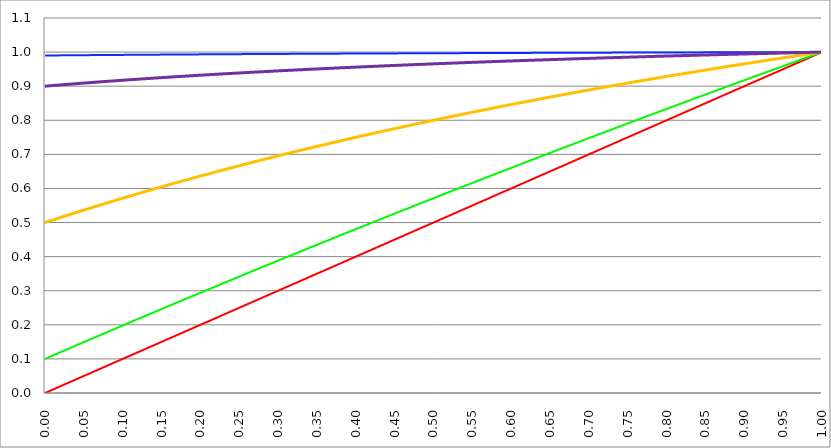
| Category | Series 1 | Series 0 | Series 2 | Series 3 | Series 4 |
|---|---|---|---|---|---|
| 0.0 | 0 | 0.1 | 0.99 | 0.5 | 0.9 |
| 0.0005 | 0.001 | 0.1 | 0.99 | 0.5 | 0.9 |
| 0.001 | 0.001 | 0.101 | 0.99 | 0.501 | 0.9 |
| 0.0015 | 0.002 | 0.101 | 0.99 | 0.501 | 0.9 |
| 0.002 | 0.002 | 0.102 | 0.99 | 0.501 | 0.9 |
| 0.0025 | 0.003 | 0.102 | 0.99 | 0.502 | 0.9 |
| 0.003 | 0.003 | 0.103 | 0.99 | 0.502 | 0.901 |
| 0.0035 | 0.004 | 0.103 | 0.99 | 0.503 | 0.901 |
| 0.004 | 0.004 | 0.104 | 0.99 | 0.503 | 0.901 |
| 0.0045 | 0.005 | 0.104 | 0.99 | 0.503 | 0.901 |
| 0.005 | 0.005 | 0.105 | 0.99 | 0.504 | 0.901 |
| 0.0055 | 0.006 | 0.105 | 0.99 | 0.504 | 0.901 |
| 0.006 | 0.006 | 0.106 | 0.99 | 0.504 | 0.901 |
| 0.0065 | 0.007 | 0.106 | 0.99 | 0.505 | 0.901 |
| 0.007 | 0.007 | 0.107 | 0.99 | 0.505 | 0.901 |
| 0.0075 | 0.008 | 0.107 | 0.99 | 0.506 | 0.901 |
| 0.008 | 0.008 | 0.108 | 0.99 | 0.506 | 0.902 |
| 0.0085 | 0.009 | 0.108 | 0.99 | 0.506 | 0.902 |
| 0.009 | 0.009 | 0.109 | 0.99 | 0.507 | 0.902 |
| 0.0095 | 0.01 | 0.109 | 0.99 | 0.507 | 0.902 |
| 0.01 | 0.01 | 0.11 | 0.99 | 0.507 | 0.902 |
| 0.0105 | 0.011 | 0.11 | 0.99 | 0.508 | 0.902 |
| 0.011 | 0.011 | 0.111 | 0.99 | 0.508 | 0.902 |
| 0.0115 | 0.012 | 0.111 | 0.99 | 0.509 | 0.902 |
| 0.012 | 0.012 | 0.112 | 0.99 | 0.509 | 0.902 |
| 0.0125 | 0.013 | 0.112 | 0.99 | 0.509 | 0.902 |
| 0.013 | 0.013 | 0.113 | 0.99 | 0.51 | 0.902 |
| 0.0135 | 0.014 | 0.113 | 0.99 | 0.51 | 0.903 |
| 0.014 | 0.014 | 0.114 | 0.99 | 0.51 | 0.903 |
| 0.0145 | 0.015 | 0.114 | 0.99 | 0.511 | 0.903 |
| 0.015 | 0.015 | 0.115 | 0.99 | 0.511 | 0.903 |
| 0.0155 | 0.016 | 0.115 | 0.99 | 0.512 | 0.903 |
| 0.016 | 0.016 | 0.116 | 0.99 | 0.512 | 0.903 |
| 0.0165 | 0.017 | 0.116 | 0.99 | 0.512 | 0.903 |
| 0.017 | 0.017 | 0.117 | 0.99 | 0.513 | 0.903 |
| 0.0175 | 0.018 | 0.117 | 0.99 | 0.513 | 0.903 |
| 0.018 | 0.018 | 0.118 | 0.99 | 0.513 | 0.903 |
| 0.0185 | 0.019 | 0.118 | 0.99 | 0.514 | 0.903 |
| 0.019 | 0.019 | 0.119 | 0.99 | 0.514 | 0.904 |
| 0.0195 | 0.02 | 0.119 | 0.99 | 0.514 | 0.904 |
| 0.02 | 0.02 | 0.12 | 0.99 | 0.515 | 0.904 |
| 0.0205 | 0.021 | 0.12 | 0.99 | 0.515 | 0.904 |
| 0.021 | 0.021 | 0.121 | 0.99 | 0.516 | 0.904 |
| 0.0215 | 0.022 | 0.121 | 0.99 | 0.516 | 0.904 |
| 0.022 | 0.022 | 0.122 | 0.99 | 0.516 | 0.904 |
| 0.0225 | 0.023 | 0.122 | 0.99 | 0.517 | 0.904 |
| 0.023 | 0.023 | 0.123 | 0.99 | 0.517 | 0.904 |
| 0.0235 | 0.024 | 0.123 | 0.99 | 0.517 | 0.904 |
| 0.024 | 0.024 | 0.124 | 0.99 | 0.518 | 0.904 |
| 0.0245 | 0.025 | 0.124 | 0.99 | 0.518 | 0.905 |
| 0.025 | 0.025 | 0.125 | 0.99 | 0.519 | 0.905 |
| 0.0255 | 0.026 | 0.125 | 0.99 | 0.519 | 0.905 |
| 0.026 | 0.026 | 0.126 | 0.991 | 0.519 | 0.905 |
| 0.0265 | 0.027 | 0.126 | 0.991 | 0.52 | 0.905 |
| 0.027 | 0.027 | 0.127 | 0.991 | 0.52 | 0.905 |
| 0.0275 | 0.028 | 0.127 | 0.991 | 0.52 | 0.905 |
| 0.028 | 0.028 | 0.128 | 0.991 | 0.521 | 0.905 |
| 0.0285 | 0.029 | 0.128 | 0.991 | 0.521 | 0.905 |
| 0.029 | 0.029 | 0.129 | 0.991 | 0.521 | 0.905 |
| 0.0295 | 0.03 | 0.129 | 0.991 | 0.522 | 0.905 |
| 0.03 | 0.03 | 0.13 | 0.991 | 0.522 | 0.906 |
| 0.0305 | 0.031 | 0.13 | 0.991 | 0.523 | 0.906 |
| 0.031 | 0.031 | 0.131 | 0.991 | 0.523 | 0.906 |
| 0.0315 | 0.032 | 0.131 | 0.991 | 0.523 | 0.906 |
| 0.032 | 0.032 | 0.132 | 0.991 | 0.524 | 0.906 |
| 0.0325 | 0.033 | 0.132 | 0.991 | 0.524 | 0.906 |
| 0.033 | 0.033 | 0.133 | 0.991 | 0.524 | 0.906 |
| 0.0335 | 0.034 | 0.133 | 0.991 | 0.525 | 0.906 |
| 0.034 | 0.034 | 0.134 | 0.991 | 0.525 | 0.906 |
| 0.0345 | 0.035 | 0.134 | 0.991 | 0.525 | 0.906 |
| 0.035 | 0.035 | 0.135 | 0.991 | 0.526 | 0.906 |
| 0.0355 | 0.036 | 0.135 | 0.991 | 0.526 | 0.907 |
| 0.036 | 0.036 | 0.136 | 0.991 | 0.527 | 0.907 |
| 0.0365 | 0.037 | 0.136 | 0.991 | 0.527 | 0.907 |
| 0.037 | 0.037 | 0.136 | 0.991 | 0.527 | 0.907 |
| 0.0375 | 0.038 | 0.137 | 0.991 | 0.528 | 0.907 |
| 0.038 | 0.038 | 0.137 | 0.991 | 0.528 | 0.907 |
| 0.0385 | 0.039 | 0.138 | 0.991 | 0.528 | 0.907 |
| 0.039 | 0.039 | 0.138 | 0.991 | 0.529 | 0.907 |
| 0.0395 | 0.04 | 0.139 | 0.991 | 0.529 | 0.907 |
| 0.04 | 0.04 | 0.139 | 0.991 | 0.529 | 0.907 |
| 0.0405 | 0.041 | 0.14 | 0.991 | 0.53 | 0.907 |
| 0.041 | 0.041 | 0.14 | 0.991 | 0.53 | 0.908 |
| 0.0415 | 0.042 | 0.141 | 0.991 | 0.53 | 0.908 |
| 0.042 | 0.042 | 0.141 | 0.991 | 0.531 | 0.908 |
| 0.0425 | 0.043 | 0.142 | 0.991 | 0.531 | 0.908 |
| 0.043 | 0.043 | 0.142 | 0.991 | 0.532 | 0.908 |
| 0.0435 | 0.044 | 0.143 | 0.991 | 0.532 | 0.908 |
| 0.044 | 0.044 | 0.143 | 0.991 | 0.532 | 0.908 |
| 0.0445 | 0.045 | 0.144 | 0.991 | 0.533 | 0.908 |
| 0.045 | 0.045 | 0.144 | 0.991 | 0.533 | 0.908 |
| 0.0455 | 0.046 | 0.145 | 0.991 | 0.533 | 0.908 |
| 0.046 | 0.046 | 0.145 | 0.991 | 0.534 | 0.908 |
| 0.0465 | 0.047 | 0.146 | 0.991 | 0.534 | 0.908 |
| 0.047 | 0.047 | 0.146 | 0.991 | 0.534 | 0.909 |
| 0.0475 | 0.048 | 0.147 | 0.991 | 0.535 | 0.909 |
| 0.048 | 0.048 | 0.147 | 0.991 | 0.535 | 0.909 |
| 0.0485 | 0.049 | 0.148 | 0.991 | 0.536 | 0.909 |
| 0.049 | 0.049 | 0.148 | 0.991 | 0.536 | 0.909 |
| 0.0495 | 0.05 | 0.149 | 0.991 | 0.536 | 0.909 |
| 0.05 | 0.05 | 0.149 | 0.991 | 0.537 | 0.909 |
| 0.0505 | 0.051 | 0.15 | 0.991 | 0.537 | 0.909 |
| 0.051 | 0.051 | 0.15 | 0.991 | 0.537 | 0.909 |
| 0.0515 | 0.052 | 0.151 | 0.991 | 0.538 | 0.909 |
| 0.052 | 0.052 | 0.151 | 0.991 | 0.538 | 0.909 |
| 0.0525 | 0.053 | 0.152 | 0.991 | 0.538 | 0.91 |
| 0.053 | 0.053 | 0.152 | 0.991 | 0.539 | 0.91 |
| 0.0535 | 0.054 | 0.153 | 0.991 | 0.539 | 0.91 |
| 0.054 | 0.054 | 0.153 | 0.991 | 0.539 | 0.91 |
| 0.0545 | 0.055 | 0.154 | 0.991 | 0.54 | 0.91 |
| 0.055 | 0.055 | 0.154 | 0.991 | 0.54 | 0.91 |
| 0.0555 | 0.056 | 0.155 | 0.991 | 0.541 | 0.91 |
| 0.056 | 0.056 | 0.155 | 0.991 | 0.541 | 0.91 |
| 0.0565 | 0.057 | 0.156 | 0.991 | 0.541 | 0.91 |
| 0.057 | 0.057 | 0.156 | 0.991 | 0.542 | 0.91 |
| 0.0575 | 0.058 | 0.157 | 0.991 | 0.542 | 0.91 |
| 0.058 | 0.058 | 0.157 | 0.991 | 0.542 | 0.91 |
| 0.0585 | 0.059 | 0.158 | 0.991 | 0.543 | 0.911 |
| 0.059 | 0.059 | 0.158 | 0.991 | 0.543 | 0.911 |
| 0.0595 | 0.06 | 0.159 | 0.991 | 0.543 | 0.911 |
| 0.06 | 0.06 | 0.159 | 0.991 | 0.544 | 0.911 |
| 0.0605 | 0.061 | 0.16 | 0.991 | 0.544 | 0.911 |
| 0.061 | 0.061 | 0.16 | 0.991 | 0.544 | 0.911 |
| 0.0615 | 0.062 | 0.161 | 0.991 | 0.545 | 0.911 |
| 0.062 | 0.062 | 0.161 | 0.991 | 0.545 | 0.911 |
| 0.0625 | 0.063 | 0.161 | 0.991 | 0.545 | 0.911 |
| 0.063 | 0.063 | 0.162 | 0.991 | 0.546 | 0.911 |
| 0.0635 | 0.064 | 0.162 | 0.991 | 0.546 | 0.911 |
| 0.064 | 0.064 | 0.163 | 0.991 | 0.547 | 0.911 |
| 0.0645 | 0.065 | 0.163 | 0.991 | 0.547 | 0.912 |
| 0.065 | 0.065 | 0.164 | 0.991 | 0.547 | 0.912 |
| 0.0655 | 0.066 | 0.164 | 0.991 | 0.548 | 0.912 |
| 0.066 | 0.066 | 0.165 | 0.991 | 0.548 | 0.912 |
| 0.0665 | 0.067 | 0.165 | 0.991 | 0.548 | 0.912 |
| 0.067 | 0.067 | 0.166 | 0.991 | 0.549 | 0.912 |
| 0.0675 | 0.068 | 0.166 | 0.991 | 0.549 | 0.912 |
| 0.068 | 0.068 | 0.167 | 0.991 | 0.549 | 0.912 |
| 0.0685 | 0.069 | 0.167 | 0.991 | 0.55 | 0.912 |
| 0.069 | 0.069 | 0.168 | 0.991 | 0.55 | 0.912 |
| 0.0695 | 0.07 | 0.168 | 0.991 | 0.55 | 0.912 |
| 0.07 | 0.07 | 0.169 | 0.991 | 0.551 | 0.913 |
| 0.0705 | 0.071 | 0.169 | 0.991 | 0.551 | 0.913 |
| 0.071 | 0.071 | 0.17 | 0.991 | 0.551 | 0.913 |
| 0.0715 | 0.072 | 0.17 | 0.991 | 0.552 | 0.913 |
| 0.072 | 0.072 | 0.171 | 0.991 | 0.552 | 0.913 |
| 0.0725 | 0.073 | 0.171 | 0.991 | 0.552 | 0.913 |
| 0.073 | 0.073 | 0.172 | 0.991 | 0.553 | 0.913 |
| 0.0735 | 0.074 | 0.172 | 0.991 | 0.553 | 0.913 |
| 0.074 | 0.074 | 0.173 | 0.991 | 0.554 | 0.913 |
| 0.0745 | 0.075 | 0.173 | 0.991 | 0.554 | 0.913 |
| 0.075 | 0.075 | 0.174 | 0.991 | 0.554 | 0.913 |
| 0.0755 | 0.076 | 0.174 | 0.991 | 0.555 | 0.913 |
| 0.076 | 0.076 | 0.175 | 0.991 | 0.555 | 0.914 |
| 0.0765 | 0.077 | 0.175 | 0.991 | 0.555 | 0.914 |
| 0.077 | 0.077 | 0.176 | 0.991 | 0.556 | 0.914 |
| 0.0775 | 0.078 | 0.176 | 0.991 | 0.556 | 0.914 |
| 0.078 | 0.078 | 0.177 | 0.991 | 0.556 | 0.914 |
| 0.0785 | 0.079 | 0.177 | 0.991 | 0.557 | 0.914 |
| 0.079 | 0.079 | 0.178 | 0.991 | 0.557 | 0.914 |
| 0.0795 | 0.08 | 0.178 | 0.991 | 0.557 | 0.914 |
| 0.08 | 0.08 | 0.179 | 0.991 | 0.558 | 0.914 |
| 0.0805 | 0.081 | 0.179 | 0.991 | 0.558 | 0.914 |
| 0.081 | 0.081 | 0.18 | 0.991 | 0.558 | 0.914 |
| 0.0815 | 0.082 | 0.18 | 0.992 | 0.559 | 0.914 |
| 0.082 | 0.082 | 0.181 | 0.992 | 0.559 | 0.915 |
| 0.0825 | 0.083 | 0.181 | 0.992 | 0.559 | 0.915 |
| 0.083 | 0.083 | 0.181 | 0.992 | 0.56 | 0.915 |
| 0.0835 | 0.084 | 0.182 | 0.992 | 0.56 | 0.915 |
| 0.084 | 0.084 | 0.182 | 0.992 | 0.56 | 0.915 |
| 0.0845 | 0.085 | 0.183 | 0.992 | 0.561 | 0.915 |
| 0.085 | 0.085 | 0.183 | 0.992 | 0.561 | 0.915 |
| 0.0855 | 0.086 | 0.184 | 0.992 | 0.561 | 0.915 |
| 0.086 | 0.086 | 0.184 | 0.992 | 0.562 | 0.915 |
| 0.0865 | 0.087 | 0.185 | 0.992 | 0.562 | 0.915 |
| 0.087 | 0.087 | 0.185 | 0.992 | 0.563 | 0.915 |
| 0.0875 | 0.088 | 0.186 | 0.992 | 0.563 | 0.915 |
| 0.088 | 0.088 | 0.186 | 0.992 | 0.563 | 0.915 |
| 0.0885 | 0.089 | 0.187 | 0.992 | 0.564 | 0.916 |
| 0.089 | 0.089 | 0.187 | 0.992 | 0.564 | 0.916 |
| 0.0895 | 0.09 | 0.188 | 0.992 | 0.564 | 0.916 |
| 0.09 | 0.09 | 0.188 | 0.992 | 0.565 | 0.916 |
| 0.0905 | 0.091 | 0.189 | 0.992 | 0.565 | 0.916 |
| 0.091 | 0.091 | 0.189 | 0.992 | 0.565 | 0.916 |
| 0.0915 | 0.092 | 0.19 | 0.992 | 0.566 | 0.916 |
| 0.092 | 0.092 | 0.19 | 0.992 | 0.566 | 0.916 |
| 0.0925 | 0.093 | 0.191 | 0.992 | 0.566 | 0.916 |
| 0.093 | 0.093 | 0.191 | 0.992 | 0.567 | 0.916 |
| 0.0935 | 0.094 | 0.192 | 0.992 | 0.567 | 0.916 |
| 0.094 | 0.094 | 0.192 | 0.992 | 0.567 | 0.916 |
| 0.0945 | 0.095 | 0.193 | 0.992 | 0.568 | 0.917 |
| 0.095 | 0.095 | 0.193 | 0.992 | 0.568 | 0.917 |
| 0.0955 | 0.096 | 0.194 | 0.992 | 0.568 | 0.917 |
| 0.096 | 0.096 | 0.194 | 0.992 | 0.569 | 0.917 |
| 0.0965 | 0.097 | 0.195 | 0.992 | 0.569 | 0.917 |
| 0.097 | 0.097 | 0.195 | 0.992 | 0.569 | 0.917 |
| 0.0975 | 0.098 | 0.196 | 0.992 | 0.57 | 0.917 |
| 0.098 | 0.098 | 0.196 | 0.992 | 0.57 | 0.917 |
| 0.0985 | 0.099 | 0.197 | 0.992 | 0.57 | 0.917 |
| 0.099 | 0.099 | 0.197 | 0.992 | 0.571 | 0.917 |
| 0.0995 | 0.1 | 0.198 | 0.992 | 0.571 | 0.917 |
| 0.1 | 0.1 | 0.198 | 0.992 | 0.571 | 0.917 |
| 0.1005 | 0.101 | 0.199 | 0.992 | 0.572 | 0.918 |
| 0.101 | 0.101 | 0.199 | 0.992 | 0.572 | 0.918 |
| 0.1015 | 0.102 | 0.199 | 0.992 | 0.572 | 0.918 |
| 0.102 | 0.102 | 0.2 | 0.992 | 0.573 | 0.918 |
| 0.1025 | 0.103 | 0.2 | 0.992 | 0.573 | 0.918 |
| 0.103 | 0.103 | 0.201 | 0.992 | 0.573 | 0.918 |
| 0.1035 | 0.104 | 0.201 | 0.992 | 0.574 | 0.918 |
| 0.104 | 0.104 | 0.202 | 0.992 | 0.574 | 0.918 |
| 0.1045 | 0.105 | 0.202 | 0.992 | 0.574 | 0.918 |
| 0.105 | 0.105 | 0.203 | 0.992 | 0.575 | 0.918 |
| 0.1055 | 0.106 | 0.203 | 0.992 | 0.575 | 0.918 |
| 0.106 | 0.106 | 0.204 | 0.992 | 0.575 | 0.918 |
| 0.1065 | 0.107 | 0.204 | 0.992 | 0.576 | 0.918 |
| 0.107 | 0.107 | 0.205 | 0.992 | 0.576 | 0.919 |
| 0.1075 | 0.108 | 0.205 | 0.992 | 0.577 | 0.919 |
| 0.108 | 0.108 | 0.206 | 0.992 | 0.577 | 0.919 |
| 0.1085 | 0.109 | 0.206 | 0.992 | 0.577 | 0.919 |
| 0.109 | 0.109 | 0.207 | 0.992 | 0.578 | 0.919 |
| 0.1095 | 0.11 | 0.207 | 0.992 | 0.578 | 0.919 |
| 0.11 | 0.11 | 0.208 | 0.992 | 0.578 | 0.919 |
| 0.1105 | 0.111 | 0.208 | 0.992 | 0.579 | 0.919 |
| 0.111 | 0.111 | 0.209 | 0.992 | 0.579 | 0.919 |
| 0.1115 | 0.112 | 0.209 | 0.992 | 0.579 | 0.919 |
| 0.112 | 0.112 | 0.21 | 0.992 | 0.58 | 0.919 |
| 0.1125 | 0.113 | 0.21 | 0.992 | 0.58 | 0.919 |
| 0.113 | 0.113 | 0.211 | 0.992 | 0.58 | 0.919 |
| 0.1135 | 0.114 | 0.211 | 0.992 | 0.581 | 0.92 |
| 0.114 | 0.114 | 0.212 | 0.992 | 0.581 | 0.92 |
| 0.1145 | 0.115 | 0.212 | 0.992 | 0.581 | 0.92 |
| 0.115 | 0.115 | 0.213 | 0.992 | 0.582 | 0.92 |
| 0.1155 | 0.116 | 0.213 | 0.992 | 0.582 | 0.92 |
| 0.116 | 0.116 | 0.214 | 0.992 | 0.582 | 0.92 |
| 0.1165 | 0.117 | 0.214 | 0.992 | 0.583 | 0.92 |
| 0.117 | 0.117 | 0.214 | 0.992 | 0.583 | 0.92 |
| 0.1175 | 0.118 | 0.215 | 0.992 | 0.583 | 0.92 |
| 0.118 | 0.118 | 0.215 | 0.992 | 0.584 | 0.92 |
| 0.1185 | 0.119 | 0.216 | 0.992 | 0.584 | 0.92 |
| 0.119 | 0.119 | 0.216 | 0.992 | 0.584 | 0.92 |
| 0.1195 | 0.12 | 0.217 | 0.992 | 0.585 | 0.921 |
| 0.12 | 0.12 | 0.217 | 0.992 | 0.585 | 0.921 |
| 0.1205 | 0.121 | 0.218 | 0.992 | 0.585 | 0.921 |
| 0.121 | 0.121 | 0.218 | 0.992 | 0.586 | 0.921 |
| 0.1215 | 0.122 | 0.219 | 0.992 | 0.586 | 0.921 |
| 0.122 | 0.122 | 0.219 | 0.992 | 0.586 | 0.921 |
| 0.1225 | 0.123 | 0.22 | 0.992 | 0.587 | 0.921 |
| 0.123 | 0.123 | 0.22 | 0.992 | 0.587 | 0.921 |
| 0.1235 | 0.124 | 0.221 | 0.992 | 0.587 | 0.921 |
| 0.124 | 0.124 | 0.221 | 0.992 | 0.588 | 0.921 |
| 0.1245 | 0.125 | 0.222 | 0.992 | 0.588 | 0.921 |
| 0.125 | 0.125 | 0.222 | 0.992 | 0.588 | 0.921 |
| 0.1255 | 0.126 | 0.223 | 0.992 | 0.589 | 0.921 |
| 0.126 | 0.126 | 0.223 | 0.992 | 0.589 | 0.922 |
| 0.1265 | 0.127 | 0.224 | 0.992 | 0.589 | 0.922 |
| 0.127 | 0.127 | 0.224 | 0.992 | 0.59 | 0.922 |
| 0.1275 | 0.128 | 0.225 | 0.992 | 0.59 | 0.922 |
| 0.128 | 0.128 | 0.225 | 0.992 | 0.59 | 0.922 |
| 0.1285 | 0.129 | 0.226 | 0.992 | 0.591 | 0.922 |
| 0.129 | 0.129 | 0.226 | 0.992 | 0.591 | 0.922 |
| 0.1295 | 0.13 | 0.227 | 0.992 | 0.591 | 0.922 |
| 0.13 | 0.13 | 0.227 | 0.992 | 0.592 | 0.922 |
| 0.1305 | 0.131 | 0.228 | 0.992 | 0.592 | 0.922 |
| 0.131 | 0.131 | 0.228 | 0.992 | 0.592 | 0.922 |
| 0.1315 | 0.132 | 0.228 | 0.992 | 0.593 | 0.922 |
| 0.132 | 0.132 | 0.229 | 0.992 | 0.593 | 0.922 |
| 0.1325 | 0.133 | 0.229 | 0.992 | 0.593 | 0.922 |
| 0.133 | 0.133 | 0.23 | 0.992 | 0.594 | 0.923 |
| 0.1335 | 0.134 | 0.23 | 0.992 | 0.594 | 0.923 |
| 0.134 | 0.134 | 0.231 | 0.992 | 0.594 | 0.923 |
| 0.1345 | 0.135 | 0.231 | 0.992 | 0.595 | 0.923 |
| 0.135 | 0.135 | 0.232 | 0.992 | 0.595 | 0.923 |
| 0.1355 | 0.136 | 0.232 | 0.992 | 0.595 | 0.923 |
| 0.136 | 0.136 | 0.233 | 0.992 | 0.596 | 0.923 |
| 0.1365 | 0.137 | 0.233 | 0.992 | 0.596 | 0.923 |
| 0.137 | 0.137 | 0.234 | 0.992 | 0.596 | 0.923 |
| 0.1375 | 0.138 | 0.234 | 0.992 | 0.596 | 0.923 |
| 0.138 | 0.138 | 0.235 | 0.992 | 0.597 | 0.923 |
| 0.1385 | 0.139 | 0.235 | 0.992 | 0.597 | 0.923 |
| 0.139 | 0.139 | 0.236 | 0.992 | 0.597 | 0.923 |
| 0.1395 | 0.14 | 0.236 | 0.992 | 0.598 | 0.924 |
| 0.14 | 0.14 | 0.237 | 0.992 | 0.598 | 0.924 |
| 0.1405 | 0.141 | 0.237 | 0.992 | 0.598 | 0.924 |
| 0.141 | 0.141 | 0.238 | 0.992 | 0.599 | 0.924 |
| 0.1415 | 0.142 | 0.238 | 0.992 | 0.599 | 0.924 |
| 0.142 | 0.142 | 0.239 | 0.992 | 0.599 | 0.924 |
| 0.1425 | 0.143 | 0.239 | 0.992 | 0.6 | 0.924 |
| 0.143 | 0.143 | 0.24 | 0.992 | 0.6 | 0.924 |
| 0.1435 | 0.144 | 0.24 | 0.993 | 0.6 | 0.924 |
| 0.144 | 0.144 | 0.241 | 0.993 | 0.601 | 0.924 |
| 0.1445 | 0.145 | 0.241 | 0.993 | 0.601 | 0.924 |
| 0.145 | 0.145 | 0.241 | 0.993 | 0.601 | 0.924 |
| 0.1455 | 0.146 | 0.242 | 0.993 | 0.602 | 0.924 |
| 0.146 | 0.146 | 0.242 | 0.993 | 0.602 | 0.925 |
| 0.1465 | 0.147 | 0.243 | 0.993 | 0.602 | 0.925 |
| 0.147 | 0.147 | 0.243 | 0.993 | 0.603 | 0.925 |
| 0.1475 | 0.148 | 0.244 | 0.993 | 0.603 | 0.925 |
| 0.148 | 0.148 | 0.244 | 0.993 | 0.603 | 0.925 |
| 0.1485 | 0.149 | 0.245 | 0.993 | 0.604 | 0.925 |
| 0.149 | 0.149 | 0.245 | 0.993 | 0.604 | 0.925 |
| 0.1495 | 0.15 | 0.246 | 0.993 | 0.604 | 0.925 |
| 0.15 | 0.15 | 0.246 | 0.993 | 0.605 | 0.925 |
| 0.1505 | 0.151 | 0.247 | 0.993 | 0.605 | 0.925 |
| 0.151 | 0.151 | 0.247 | 0.993 | 0.605 | 0.925 |
| 0.1515 | 0.152 | 0.248 | 0.993 | 0.606 | 0.925 |
| 0.152 | 0.152 | 0.248 | 0.993 | 0.606 | 0.925 |
| 0.1525 | 0.153 | 0.249 | 0.993 | 0.606 | 0.925 |
| 0.153 | 0.153 | 0.249 | 0.993 | 0.607 | 0.926 |
| 0.1535 | 0.154 | 0.25 | 0.993 | 0.607 | 0.926 |
| 0.154 | 0.154 | 0.25 | 0.993 | 0.607 | 0.926 |
| 0.1545 | 0.155 | 0.251 | 0.993 | 0.608 | 0.926 |
| 0.155 | 0.155 | 0.251 | 0.993 | 0.608 | 0.926 |
| 0.1555 | 0.156 | 0.252 | 0.993 | 0.608 | 0.926 |
| 0.156 | 0.156 | 0.252 | 0.993 | 0.609 | 0.926 |
| 0.1565 | 0.157 | 0.253 | 0.993 | 0.609 | 0.926 |
| 0.157 | 0.157 | 0.253 | 0.993 | 0.609 | 0.926 |
| 0.1575 | 0.158 | 0.254 | 0.993 | 0.61 | 0.926 |
| 0.158 | 0.158 | 0.254 | 0.993 | 0.61 | 0.926 |
| 0.1585 | 0.159 | 0.254 | 0.993 | 0.61 | 0.926 |
| 0.159 | 0.159 | 0.255 | 0.993 | 0.61 | 0.926 |
| 0.1595 | 0.16 | 0.255 | 0.993 | 0.611 | 0.927 |
| 0.16 | 0.16 | 0.256 | 0.993 | 0.611 | 0.927 |
| 0.1605 | 0.161 | 0.256 | 0.993 | 0.611 | 0.927 |
| 0.161 | 0.161 | 0.257 | 0.993 | 0.612 | 0.927 |
| 0.1615 | 0.162 | 0.257 | 0.993 | 0.612 | 0.927 |
| 0.162 | 0.162 | 0.258 | 0.993 | 0.612 | 0.927 |
| 0.1625 | 0.163 | 0.258 | 0.993 | 0.613 | 0.927 |
| 0.163 | 0.163 | 0.259 | 0.993 | 0.613 | 0.927 |
| 0.1635 | 0.164 | 0.259 | 0.993 | 0.613 | 0.927 |
| 0.164 | 0.164 | 0.26 | 0.993 | 0.614 | 0.927 |
| 0.1645 | 0.165 | 0.26 | 0.993 | 0.614 | 0.927 |
| 0.165 | 0.165 | 0.261 | 0.993 | 0.614 | 0.927 |
| 0.1655 | 0.166 | 0.261 | 0.993 | 0.615 | 0.927 |
| 0.166 | 0.166 | 0.262 | 0.993 | 0.615 | 0.927 |
| 0.1665 | 0.167 | 0.262 | 0.993 | 0.615 | 0.928 |
| 0.167 | 0.167 | 0.263 | 0.993 | 0.616 | 0.928 |
| 0.1675 | 0.168 | 0.263 | 0.993 | 0.616 | 0.928 |
| 0.168 | 0.168 | 0.264 | 0.993 | 0.616 | 0.928 |
| 0.1685 | 0.169 | 0.264 | 0.993 | 0.617 | 0.928 |
| 0.169 | 0.169 | 0.265 | 0.993 | 0.617 | 0.928 |
| 0.1695 | 0.17 | 0.265 | 0.993 | 0.617 | 0.928 |
| 0.17 | 0.17 | 0.265 | 0.993 | 0.618 | 0.928 |
| 0.1705 | 0.171 | 0.266 | 0.993 | 0.618 | 0.928 |
| 0.171 | 0.171 | 0.266 | 0.993 | 0.618 | 0.928 |
| 0.1715 | 0.172 | 0.267 | 0.993 | 0.618 | 0.928 |
| 0.172 | 0.172 | 0.267 | 0.993 | 0.619 | 0.928 |
| 0.1725 | 0.173 | 0.268 | 0.993 | 0.619 | 0.928 |
| 0.173 | 0.173 | 0.268 | 0.993 | 0.619 | 0.928 |
| 0.1735 | 0.174 | 0.269 | 0.993 | 0.62 | 0.929 |
| 0.174 | 0.174 | 0.269 | 0.993 | 0.62 | 0.929 |
| 0.1745 | 0.175 | 0.27 | 0.993 | 0.62 | 0.929 |
| 0.175 | 0.175 | 0.27 | 0.993 | 0.621 | 0.929 |
| 0.1755 | 0.176 | 0.271 | 0.993 | 0.621 | 0.929 |
| 0.176 | 0.176 | 0.271 | 0.993 | 0.621 | 0.929 |
| 0.1765 | 0.177 | 0.272 | 0.993 | 0.622 | 0.929 |
| 0.177 | 0.177 | 0.272 | 0.993 | 0.622 | 0.929 |
| 0.1775 | 0.178 | 0.273 | 0.993 | 0.622 | 0.929 |
| 0.178 | 0.178 | 0.273 | 0.993 | 0.623 | 0.929 |
| 0.1785 | 0.179 | 0.274 | 0.993 | 0.623 | 0.929 |
| 0.179 | 0.179 | 0.274 | 0.993 | 0.623 | 0.929 |
| 0.1795 | 0.18 | 0.275 | 0.993 | 0.624 | 0.929 |
| 0.18 | 0.18 | 0.275 | 0.993 | 0.624 | 0.929 |
| 0.1805 | 0.181 | 0.276 | 0.993 | 0.624 | 0.93 |
| 0.181 | 0.181 | 0.276 | 0.993 | 0.624 | 0.93 |
| 0.1815 | 0.182 | 0.276 | 0.993 | 0.625 | 0.93 |
| 0.182 | 0.182 | 0.277 | 0.993 | 0.625 | 0.93 |
| 0.1825 | 0.183 | 0.277 | 0.993 | 0.625 | 0.93 |
| 0.183 | 0.183 | 0.278 | 0.993 | 0.626 | 0.93 |
| 0.1835 | 0.184 | 0.278 | 0.993 | 0.626 | 0.93 |
| 0.184 | 0.184 | 0.279 | 0.993 | 0.626 | 0.93 |
| 0.1845 | 0.185 | 0.279 | 0.993 | 0.627 | 0.93 |
| 0.185 | 0.185 | 0.28 | 0.993 | 0.627 | 0.93 |
| 0.1855 | 0.186 | 0.28 | 0.993 | 0.627 | 0.93 |
| 0.186 | 0.186 | 0.281 | 0.993 | 0.628 | 0.93 |
| 0.1865 | 0.187 | 0.281 | 0.993 | 0.628 | 0.93 |
| 0.187 | 0.187 | 0.282 | 0.993 | 0.628 | 0.93 |
| 0.1875 | 0.188 | 0.282 | 0.993 | 0.629 | 0.93 |
| 0.188 | 0.188 | 0.283 | 0.993 | 0.629 | 0.931 |
| 0.1885 | 0.189 | 0.283 | 0.993 | 0.629 | 0.931 |
| 0.189 | 0.189 | 0.284 | 0.993 | 0.63 | 0.931 |
| 0.1895 | 0.19 | 0.284 | 0.993 | 0.63 | 0.931 |
| 0.19 | 0.19 | 0.285 | 0.993 | 0.63 | 0.931 |
| 0.1905 | 0.191 | 0.285 | 0.993 | 0.63 | 0.931 |
| 0.191 | 0.191 | 0.286 | 0.993 | 0.631 | 0.931 |
| 0.1915 | 0.192 | 0.286 | 0.993 | 0.631 | 0.931 |
| 0.192 | 0.192 | 0.286 | 0.993 | 0.631 | 0.931 |
| 0.1925 | 0.193 | 0.287 | 0.993 | 0.632 | 0.931 |
| 0.193 | 0.193 | 0.287 | 0.993 | 0.632 | 0.931 |
| 0.1935 | 0.194 | 0.288 | 0.993 | 0.632 | 0.931 |
| 0.194 | 0.194 | 0.288 | 0.993 | 0.633 | 0.931 |
| 0.1945 | 0.195 | 0.289 | 0.993 | 0.633 | 0.931 |
| 0.195 | 0.195 | 0.289 | 0.993 | 0.633 | 0.932 |
| 0.1955 | 0.196 | 0.29 | 0.993 | 0.634 | 0.932 |
| 0.196 | 0.196 | 0.29 | 0.993 | 0.634 | 0.932 |
| 0.1965 | 0.197 | 0.291 | 0.993 | 0.634 | 0.932 |
| 0.197 | 0.197 | 0.291 | 0.993 | 0.635 | 0.932 |
| 0.1975 | 0.198 | 0.292 | 0.993 | 0.635 | 0.932 |
| 0.198 | 0.198 | 0.292 | 0.993 | 0.635 | 0.932 |
| 0.1985 | 0.199 | 0.293 | 0.993 | 0.635 | 0.932 |
| 0.199 | 0.199 | 0.293 | 0.993 | 0.636 | 0.932 |
| 0.1995 | 0.2 | 0.294 | 0.993 | 0.636 | 0.932 |
| 0.2 | 0.2 | 0.294 | 0.993 | 0.636 | 0.932 |
| 0.2005 | 0.201 | 0.295 | 0.993 | 0.637 | 0.932 |
| 0.201 | 0.201 | 0.295 | 0.993 | 0.637 | 0.932 |
| 0.2015 | 0.202 | 0.296 | 0.993 | 0.637 | 0.932 |
| 0.202 | 0.202 | 0.296 | 0.993 | 0.638 | 0.932 |
| 0.2025 | 0.203 | 0.296 | 0.993 | 0.638 | 0.933 |
| 0.203 | 0.203 | 0.297 | 0.993 | 0.638 | 0.933 |
| 0.2035 | 0.204 | 0.297 | 0.993 | 0.639 | 0.933 |
| 0.204 | 0.204 | 0.298 | 0.993 | 0.639 | 0.933 |
| 0.2045 | 0.205 | 0.298 | 0.993 | 0.639 | 0.933 |
| 0.205 | 0.205 | 0.299 | 0.993 | 0.639 | 0.933 |
| 0.2055 | 0.206 | 0.299 | 0.993 | 0.64 | 0.933 |
| 0.206 | 0.206 | 0.3 | 0.993 | 0.64 | 0.933 |
| 0.2065 | 0.207 | 0.3 | 0.993 | 0.64 | 0.933 |
| 0.207 | 0.207 | 0.301 | 0.993 | 0.641 | 0.933 |
| 0.2075 | 0.208 | 0.301 | 0.993 | 0.641 | 0.933 |
| 0.208 | 0.208 | 0.302 | 0.993 | 0.641 | 0.933 |
| 0.2085 | 0.209 | 0.302 | 0.993 | 0.642 | 0.933 |
| 0.209 | 0.209 | 0.303 | 0.993 | 0.642 | 0.933 |
| 0.2095 | 0.21 | 0.303 | 0.993 | 0.642 | 0.933 |
| 0.21 | 0.21 | 0.304 | 0.993 | 0.643 | 0.934 |
| 0.2105 | 0.211 | 0.304 | 0.993 | 0.643 | 0.934 |
| 0.211 | 0.211 | 0.305 | 0.993 | 0.643 | 0.934 |
| 0.2115 | 0.212 | 0.305 | 0.993 | 0.643 | 0.934 |
| 0.212 | 0.212 | 0.306 | 0.993 | 0.644 | 0.934 |
| 0.2125 | 0.213 | 0.306 | 0.993 | 0.644 | 0.934 |
| 0.213 | 0.213 | 0.306 | 0.994 | 0.644 | 0.934 |
| 0.2135 | 0.214 | 0.307 | 0.994 | 0.645 | 0.934 |
| 0.214 | 0.214 | 0.307 | 0.994 | 0.645 | 0.934 |
| 0.2145 | 0.215 | 0.308 | 0.994 | 0.645 | 0.934 |
| 0.215 | 0.215 | 0.308 | 0.994 | 0.646 | 0.934 |
| 0.2155 | 0.216 | 0.309 | 0.994 | 0.646 | 0.934 |
| 0.216 | 0.216 | 0.309 | 0.994 | 0.646 | 0.934 |
| 0.2165 | 0.217 | 0.31 | 0.994 | 0.647 | 0.934 |
| 0.217 | 0.217 | 0.31 | 0.994 | 0.647 | 0.934 |
| 0.2175 | 0.218 | 0.311 | 0.994 | 0.647 | 0.935 |
| 0.218 | 0.218 | 0.311 | 0.994 | 0.647 | 0.935 |
| 0.2185 | 0.219 | 0.312 | 0.994 | 0.648 | 0.935 |
| 0.219 | 0.219 | 0.312 | 0.994 | 0.648 | 0.935 |
| 0.2195 | 0.22 | 0.313 | 0.994 | 0.648 | 0.935 |
| 0.22 | 0.22 | 0.313 | 0.994 | 0.649 | 0.935 |
| 0.2205 | 0.221 | 0.314 | 0.994 | 0.649 | 0.935 |
| 0.221 | 0.221 | 0.314 | 0.994 | 0.649 | 0.935 |
| 0.2215 | 0.222 | 0.315 | 0.994 | 0.65 | 0.935 |
| 0.222 | 0.222 | 0.315 | 0.994 | 0.65 | 0.935 |
| 0.2225 | 0.223 | 0.315 | 0.994 | 0.65 | 0.935 |
| 0.223 | 0.223 | 0.316 | 0.994 | 0.65 | 0.935 |
| 0.2235 | 0.224 | 0.316 | 0.994 | 0.651 | 0.935 |
| 0.224 | 0.224 | 0.317 | 0.994 | 0.651 | 0.935 |
| 0.2245 | 0.225 | 0.317 | 0.994 | 0.651 | 0.935 |
| 0.225 | 0.225 | 0.318 | 0.994 | 0.652 | 0.936 |
| 0.2255 | 0.226 | 0.318 | 0.994 | 0.652 | 0.936 |
| 0.226 | 0.226 | 0.319 | 0.994 | 0.652 | 0.936 |
| 0.2265 | 0.227 | 0.319 | 0.994 | 0.653 | 0.936 |
| 0.227 | 0.227 | 0.32 | 0.994 | 0.653 | 0.936 |
| 0.2275 | 0.228 | 0.32 | 0.994 | 0.653 | 0.936 |
| 0.228 | 0.228 | 0.321 | 0.994 | 0.654 | 0.936 |
| 0.2285 | 0.229 | 0.321 | 0.994 | 0.654 | 0.936 |
| 0.229 | 0.229 | 0.322 | 0.994 | 0.654 | 0.936 |
| 0.2295 | 0.23 | 0.322 | 0.994 | 0.654 | 0.936 |
| 0.23 | 0.23 | 0.323 | 0.994 | 0.655 | 0.936 |
| 0.2305 | 0.231 | 0.323 | 0.994 | 0.655 | 0.936 |
| 0.231 | 0.231 | 0.324 | 0.994 | 0.655 | 0.936 |
| 0.2315 | 0.232 | 0.324 | 0.994 | 0.656 | 0.936 |
| 0.232 | 0.232 | 0.324 | 0.994 | 0.656 | 0.936 |
| 0.2325 | 0.233 | 0.325 | 0.994 | 0.656 | 0.937 |
| 0.233 | 0.233 | 0.325 | 0.994 | 0.657 | 0.937 |
| 0.2335 | 0.234 | 0.326 | 0.994 | 0.657 | 0.937 |
| 0.234 | 0.234 | 0.326 | 0.994 | 0.657 | 0.937 |
| 0.2345 | 0.235 | 0.327 | 0.994 | 0.657 | 0.937 |
| 0.235 | 0.235 | 0.327 | 0.994 | 0.658 | 0.937 |
| 0.2355 | 0.236 | 0.328 | 0.994 | 0.658 | 0.937 |
| 0.236 | 0.236 | 0.328 | 0.994 | 0.658 | 0.937 |
| 0.2365 | 0.237 | 0.329 | 0.994 | 0.659 | 0.937 |
| 0.237 | 0.237 | 0.329 | 0.994 | 0.659 | 0.937 |
| 0.2375 | 0.238 | 0.33 | 0.994 | 0.659 | 0.937 |
| 0.238 | 0.238 | 0.33 | 0.994 | 0.66 | 0.937 |
| 0.2385 | 0.239 | 0.331 | 0.994 | 0.66 | 0.937 |
| 0.239 | 0.239 | 0.331 | 0.994 | 0.66 | 0.937 |
| 0.2395 | 0.24 | 0.332 | 0.994 | 0.66 | 0.937 |
| 0.24 | 0.24 | 0.332 | 0.994 | 0.661 | 0.938 |
| 0.2405 | 0.241 | 0.333 | 0.994 | 0.661 | 0.938 |
| 0.241 | 0.241 | 0.333 | 0.994 | 0.661 | 0.938 |
| 0.2415 | 0.242 | 0.333 | 0.994 | 0.662 | 0.938 |
| 0.242 | 0.242 | 0.334 | 0.994 | 0.662 | 0.938 |
| 0.2425 | 0.243 | 0.334 | 0.994 | 0.662 | 0.938 |
| 0.243 | 0.243 | 0.335 | 0.994 | 0.663 | 0.938 |
| 0.2435 | 0.244 | 0.335 | 0.994 | 0.663 | 0.938 |
| 0.244 | 0.244 | 0.336 | 0.994 | 0.663 | 0.938 |
| 0.2445 | 0.245 | 0.336 | 0.994 | 0.663 | 0.938 |
| 0.245 | 0.245 | 0.337 | 0.994 | 0.664 | 0.938 |
| 0.2455 | 0.246 | 0.337 | 0.994 | 0.664 | 0.938 |
| 0.246 | 0.246 | 0.338 | 0.994 | 0.664 | 0.938 |
| 0.2465 | 0.247 | 0.338 | 0.994 | 0.665 | 0.938 |
| 0.247 | 0.247 | 0.339 | 0.994 | 0.665 | 0.938 |
| 0.2475 | 0.248 | 0.339 | 0.994 | 0.665 | 0.938 |
| 0.248 | 0.248 | 0.34 | 0.994 | 0.665 | 0.939 |
| 0.2485 | 0.249 | 0.34 | 0.994 | 0.666 | 0.939 |
| 0.249 | 0.249 | 0.341 | 0.994 | 0.666 | 0.939 |
| 0.2495 | 0.25 | 0.341 | 0.994 | 0.666 | 0.939 |
| 0.25 | 0.25 | 0.341 | 0.994 | 0.667 | 0.939 |
| 0.2505 | 0.251 | 0.342 | 0.994 | 0.667 | 0.939 |
| 0.251 | 0.251 | 0.342 | 0.994 | 0.667 | 0.939 |
| 0.2515 | 0.252 | 0.343 | 0.994 | 0.668 | 0.939 |
| 0.252 | 0.252 | 0.343 | 0.994 | 0.668 | 0.939 |
| 0.2525 | 0.253 | 0.344 | 0.994 | 0.668 | 0.939 |
| 0.253 | 0.253 | 0.344 | 0.994 | 0.668 | 0.939 |
| 0.2535 | 0.254 | 0.345 | 0.994 | 0.669 | 0.939 |
| 0.254 | 0.254 | 0.345 | 0.994 | 0.669 | 0.939 |
| 0.2545 | 0.255 | 0.346 | 0.994 | 0.669 | 0.939 |
| 0.255 | 0.255 | 0.346 | 0.994 | 0.67 | 0.939 |
| 0.2555 | 0.256 | 0.347 | 0.994 | 0.67 | 0.939 |
| 0.256 | 0.256 | 0.347 | 0.994 | 0.67 | 0.94 |
| 0.2565 | 0.257 | 0.348 | 0.994 | 0.671 | 0.94 |
| 0.257 | 0.257 | 0.348 | 0.994 | 0.671 | 0.94 |
| 0.2575 | 0.258 | 0.349 | 0.994 | 0.671 | 0.94 |
| 0.258 | 0.258 | 0.349 | 0.994 | 0.671 | 0.94 |
| 0.2585 | 0.259 | 0.349 | 0.994 | 0.672 | 0.94 |
| 0.259 | 0.259 | 0.35 | 0.994 | 0.672 | 0.94 |
| 0.2595 | 0.26 | 0.35 | 0.994 | 0.672 | 0.94 |
| 0.26 | 0.26 | 0.351 | 0.994 | 0.673 | 0.94 |
| 0.2605 | 0.261 | 0.351 | 0.994 | 0.673 | 0.94 |
| 0.261 | 0.261 | 0.352 | 0.994 | 0.673 | 0.94 |
| 0.2615 | 0.262 | 0.352 | 0.994 | 0.673 | 0.94 |
| 0.262 | 0.262 | 0.353 | 0.994 | 0.674 | 0.94 |
| 0.2625 | 0.263 | 0.353 | 0.994 | 0.674 | 0.94 |
| 0.263 | 0.263 | 0.354 | 0.994 | 0.674 | 0.94 |
| 0.2635 | 0.264 | 0.354 | 0.994 | 0.675 | 0.94 |
| 0.264 | 0.264 | 0.355 | 0.994 | 0.675 | 0.941 |
| 0.2645 | 0.265 | 0.355 | 0.994 | 0.675 | 0.941 |
| 0.265 | 0.265 | 0.356 | 0.994 | 0.675 | 0.941 |
| 0.2655 | 0.266 | 0.356 | 0.994 | 0.676 | 0.941 |
| 0.266 | 0.266 | 0.357 | 0.994 | 0.676 | 0.941 |
| 0.2665 | 0.267 | 0.357 | 0.994 | 0.676 | 0.941 |
| 0.267 | 0.267 | 0.357 | 0.994 | 0.677 | 0.941 |
| 0.2675 | 0.268 | 0.358 | 0.994 | 0.677 | 0.941 |
| 0.268 | 0.268 | 0.358 | 0.994 | 0.677 | 0.941 |
| 0.2685 | 0.269 | 0.359 | 0.994 | 0.678 | 0.941 |
| 0.269 | 0.269 | 0.359 | 0.994 | 0.678 | 0.941 |
| 0.2695 | 0.27 | 0.36 | 0.994 | 0.678 | 0.941 |
| 0.27 | 0.27 | 0.36 | 0.994 | 0.678 | 0.941 |
| 0.2705 | 0.271 | 0.361 | 0.994 | 0.679 | 0.941 |
| 0.271 | 0.271 | 0.361 | 0.994 | 0.679 | 0.941 |
| 0.2715 | 0.272 | 0.362 | 0.994 | 0.679 | 0.941 |
| 0.272 | 0.272 | 0.362 | 0.994 | 0.68 | 0.942 |
| 0.2725 | 0.273 | 0.363 | 0.994 | 0.68 | 0.942 |
| 0.273 | 0.273 | 0.363 | 0.994 | 0.68 | 0.942 |
| 0.2735 | 0.274 | 0.364 | 0.994 | 0.68 | 0.942 |
| 0.274 | 0.274 | 0.364 | 0.994 | 0.681 | 0.942 |
| 0.2745 | 0.275 | 0.364 | 0.994 | 0.681 | 0.942 |
| 0.275 | 0.275 | 0.365 | 0.994 | 0.681 | 0.942 |
| 0.2755 | 0.276 | 0.365 | 0.994 | 0.682 | 0.942 |
| 0.276 | 0.276 | 0.366 | 0.994 | 0.682 | 0.942 |
| 0.2765 | 0.277 | 0.366 | 0.994 | 0.682 | 0.942 |
| 0.277 | 0.277 | 0.367 | 0.994 | 0.682 | 0.942 |
| 0.2775 | 0.278 | 0.367 | 0.994 | 0.683 | 0.942 |
| 0.278 | 0.278 | 0.368 | 0.994 | 0.683 | 0.942 |
| 0.2785 | 0.279 | 0.368 | 0.994 | 0.683 | 0.942 |
| 0.279 | 0.279 | 0.369 | 0.994 | 0.684 | 0.942 |
| 0.2795 | 0.28 | 0.369 | 0.994 | 0.684 | 0.942 |
| 0.28 | 0.28 | 0.37 | 0.994 | 0.684 | 0.942 |
| 0.2805 | 0.281 | 0.37 | 0.994 | 0.684 | 0.943 |
| 0.281 | 0.281 | 0.371 | 0.994 | 0.685 | 0.943 |
| 0.2815 | 0.282 | 0.371 | 0.994 | 0.685 | 0.943 |
| 0.282 | 0.282 | 0.372 | 0.994 | 0.685 | 0.943 |
| 0.2825 | 0.283 | 0.372 | 0.994 | 0.686 | 0.943 |
| 0.283 | 0.283 | 0.372 | 0.994 | 0.686 | 0.943 |
| 0.2835 | 0.284 | 0.373 | 0.994 | 0.686 | 0.943 |
| 0.284 | 0.284 | 0.373 | 0.994 | 0.687 | 0.943 |
| 0.2845 | 0.285 | 0.374 | 0.994 | 0.687 | 0.943 |
| 0.285 | 0.285 | 0.374 | 0.994 | 0.687 | 0.943 |
| 0.2855 | 0.286 | 0.375 | 0.994 | 0.687 | 0.943 |
| 0.286 | 0.286 | 0.375 | 0.994 | 0.688 | 0.943 |
| 0.2865 | 0.287 | 0.376 | 0.994 | 0.688 | 0.943 |
| 0.287 | 0.287 | 0.376 | 0.994 | 0.688 | 0.943 |
| 0.2875 | 0.288 | 0.377 | 0.994 | 0.689 | 0.943 |
| 0.288 | 0.288 | 0.377 | 0.994 | 0.689 | 0.943 |
| 0.2885 | 0.289 | 0.378 | 0.994 | 0.689 | 0.944 |
| 0.289 | 0.289 | 0.378 | 0.994 | 0.689 | 0.944 |
| 0.2895 | 0.29 | 0.379 | 0.994 | 0.69 | 0.944 |
| 0.29 | 0.29 | 0.379 | 0.994 | 0.69 | 0.944 |
| 0.2905 | 0.291 | 0.379 | 0.994 | 0.69 | 0.944 |
| 0.291 | 0.291 | 0.38 | 0.994 | 0.691 | 0.944 |
| 0.2915 | 0.292 | 0.38 | 0.995 | 0.691 | 0.944 |
| 0.292 | 0.292 | 0.381 | 0.995 | 0.691 | 0.944 |
| 0.2925 | 0.293 | 0.381 | 0.995 | 0.691 | 0.944 |
| 0.293 | 0.293 | 0.382 | 0.995 | 0.692 | 0.944 |
| 0.2935 | 0.294 | 0.382 | 0.995 | 0.692 | 0.944 |
| 0.294 | 0.294 | 0.383 | 0.995 | 0.692 | 0.944 |
| 0.2945 | 0.295 | 0.383 | 0.995 | 0.693 | 0.944 |
| 0.295 | 0.295 | 0.384 | 0.995 | 0.693 | 0.944 |
| 0.2955 | 0.296 | 0.384 | 0.995 | 0.693 | 0.944 |
| 0.296 | 0.296 | 0.385 | 0.995 | 0.693 | 0.944 |
| 0.2965 | 0.297 | 0.385 | 0.995 | 0.694 | 0.944 |
| 0.297 | 0.297 | 0.386 | 0.995 | 0.694 | 0.945 |
| 0.2975 | 0.298 | 0.386 | 0.995 | 0.694 | 0.945 |
| 0.298 | 0.298 | 0.386 | 0.995 | 0.695 | 0.945 |
| 0.2985 | 0.299 | 0.387 | 0.995 | 0.695 | 0.945 |
| 0.299 | 0.299 | 0.387 | 0.995 | 0.695 | 0.945 |
| 0.2995 | 0.3 | 0.388 | 0.995 | 0.695 | 0.945 |
| 0.3 | 0.3 | 0.388 | 0.995 | 0.696 | 0.945 |
| 0.3005 | 0.301 | 0.389 | 0.995 | 0.696 | 0.945 |
| 0.301 | 0.301 | 0.389 | 0.995 | 0.696 | 0.945 |
| 0.3015 | 0.302 | 0.39 | 0.995 | 0.697 | 0.945 |
| 0.302 | 0.302 | 0.39 | 0.995 | 0.697 | 0.945 |
| 0.3025 | 0.303 | 0.391 | 0.995 | 0.697 | 0.945 |
| 0.303 | 0.303 | 0.391 | 0.995 | 0.697 | 0.945 |
| 0.3035 | 0.304 | 0.392 | 0.995 | 0.698 | 0.945 |
| 0.304 | 0.304 | 0.392 | 0.995 | 0.698 | 0.945 |
| 0.3045 | 0.305 | 0.393 | 0.995 | 0.698 | 0.945 |
| 0.305 | 0.305 | 0.393 | 0.995 | 0.698 | 0.945 |
| 0.3055 | 0.306 | 0.393 | 0.995 | 0.699 | 0.946 |
| 0.306 | 0.306 | 0.394 | 0.995 | 0.699 | 0.946 |
| 0.3065 | 0.307 | 0.394 | 0.995 | 0.699 | 0.946 |
| 0.307 | 0.307 | 0.395 | 0.995 | 0.7 | 0.946 |
| 0.3075 | 0.308 | 0.395 | 0.995 | 0.7 | 0.946 |
| 0.308 | 0.308 | 0.396 | 0.995 | 0.7 | 0.946 |
| 0.3085 | 0.309 | 0.396 | 0.995 | 0.7 | 0.946 |
| 0.309 | 0.309 | 0.397 | 0.995 | 0.701 | 0.946 |
| 0.3095 | 0.31 | 0.397 | 0.995 | 0.701 | 0.946 |
| 0.31 | 0.31 | 0.398 | 0.995 | 0.701 | 0.946 |
| 0.3105 | 0.311 | 0.398 | 0.995 | 0.702 | 0.946 |
| 0.311 | 0.311 | 0.399 | 0.995 | 0.702 | 0.946 |
| 0.3115 | 0.312 | 0.399 | 0.995 | 0.702 | 0.946 |
| 0.312 | 0.312 | 0.4 | 0.995 | 0.702 | 0.946 |
| 0.3125 | 0.313 | 0.4 | 0.995 | 0.703 | 0.946 |
| 0.313 | 0.313 | 0.4 | 0.995 | 0.703 | 0.946 |
| 0.3135 | 0.314 | 0.401 | 0.995 | 0.703 | 0.946 |
| 0.314 | 0.314 | 0.401 | 0.995 | 0.704 | 0.947 |
| 0.3145 | 0.315 | 0.402 | 0.995 | 0.704 | 0.947 |
| 0.315 | 0.315 | 0.402 | 0.995 | 0.704 | 0.947 |
| 0.3155 | 0.316 | 0.403 | 0.995 | 0.704 | 0.947 |
| 0.316 | 0.316 | 0.403 | 0.995 | 0.705 | 0.947 |
| 0.3165 | 0.317 | 0.404 | 0.995 | 0.705 | 0.947 |
| 0.317 | 0.317 | 0.404 | 0.995 | 0.705 | 0.947 |
| 0.3175 | 0.318 | 0.405 | 0.995 | 0.706 | 0.947 |
| 0.318 | 0.318 | 0.405 | 0.995 | 0.706 | 0.947 |
| 0.3185 | 0.319 | 0.406 | 0.995 | 0.706 | 0.947 |
| 0.319 | 0.319 | 0.406 | 0.995 | 0.706 | 0.947 |
| 0.3195 | 0.32 | 0.407 | 0.995 | 0.707 | 0.947 |
| 0.32 | 0.32 | 0.407 | 0.995 | 0.707 | 0.947 |
| 0.3205 | 0.321 | 0.407 | 0.995 | 0.707 | 0.947 |
| 0.321 | 0.321 | 0.408 | 0.995 | 0.707 | 0.947 |
| 0.3215 | 0.322 | 0.408 | 0.995 | 0.708 | 0.947 |
| 0.322 | 0.322 | 0.409 | 0.995 | 0.708 | 0.947 |
| 0.3225 | 0.323 | 0.409 | 0.995 | 0.708 | 0.947 |
| 0.323 | 0.323 | 0.41 | 0.995 | 0.709 | 0.948 |
| 0.3235 | 0.324 | 0.41 | 0.995 | 0.709 | 0.948 |
| 0.324 | 0.324 | 0.411 | 0.995 | 0.709 | 0.948 |
| 0.3245 | 0.325 | 0.411 | 0.995 | 0.709 | 0.948 |
| 0.325 | 0.325 | 0.412 | 0.995 | 0.71 | 0.948 |
| 0.3255 | 0.326 | 0.412 | 0.995 | 0.71 | 0.948 |
| 0.326 | 0.326 | 0.413 | 0.995 | 0.71 | 0.948 |
| 0.3265 | 0.327 | 0.413 | 0.995 | 0.711 | 0.948 |
| 0.327 | 0.327 | 0.413 | 0.995 | 0.711 | 0.948 |
| 0.3275 | 0.328 | 0.414 | 0.995 | 0.711 | 0.948 |
| 0.328 | 0.328 | 0.414 | 0.995 | 0.711 | 0.948 |
| 0.3285 | 0.329 | 0.415 | 0.995 | 0.712 | 0.948 |
| 0.329 | 0.329 | 0.415 | 0.995 | 0.712 | 0.948 |
| 0.3295 | 0.33 | 0.416 | 0.995 | 0.712 | 0.948 |
| 0.33 | 0.33 | 0.416 | 0.995 | 0.712 | 0.948 |
| 0.3305 | 0.331 | 0.417 | 0.995 | 0.713 | 0.948 |
| 0.331 | 0.331 | 0.417 | 0.995 | 0.713 | 0.948 |
| 0.3315 | 0.332 | 0.418 | 0.995 | 0.713 | 0.949 |
| 0.332 | 0.332 | 0.418 | 0.995 | 0.714 | 0.949 |
| 0.3325 | 0.333 | 0.419 | 0.995 | 0.714 | 0.949 |
| 0.333 | 0.333 | 0.419 | 0.995 | 0.714 | 0.949 |
| 0.3335 | 0.334 | 0.42 | 0.995 | 0.714 | 0.949 |
| 0.334 | 0.334 | 0.42 | 0.995 | 0.715 | 0.949 |
| 0.3345 | 0.335 | 0.42 | 0.995 | 0.715 | 0.949 |
| 0.335 | 0.335 | 0.421 | 0.995 | 0.715 | 0.949 |
| 0.3355 | 0.336 | 0.421 | 0.995 | 0.715 | 0.949 |
| 0.336 | 0.336 | 0.422 | 0.995 | 0.716 | 0.949 |
| 0.3365 | 0.337 | 0.422 | 0.995 | 0.716 | 0.949 |
| 0.337 | 0.337 | 0.423 | 0.995 | 0.716 | 0.949 |
| 0.3375 | 0.338 | 0.423 | 0.995 | 0.717 | 0.949 |
| 0.338 | 0.338 | 0.424 | 0.995 | 0.717 | 0.949 |
| 0.3385 | 0.339 | 0.424 | 0.995 | 0.717 | 0.949 |
| 0.339 | 0.339 | 0.425 | 0.995 | 0.717 | 0.949 |
| 0.3395 | 0.34 | 0.425 | 0.995 | 0.718 | 0.949 |
| 0.34 | 0.34 | 0.426 | 0.995 | 0.718 | 0.949 |
| 0.3405 | 0.341 | 0.426 | 0.995 | 0.718 | 0.95 |
| 0.341 | 0.341 | 0.426 | 0.995 | 0.718 | 0.95 |
| 0.3415 | 0.342 | 0.427 | 0.995 | 0.719 | 0.95 |
| 0.342 | 0.342 | 0.427 | 0.995 | 0.719 | 0.95 |
| 0.3425 | 0.343 | 0.428 | 0.995 | 0.719 | 0.95 |
| 0.343 | 0.343 | 0.428 | 0.995 | 0.72 | 0.95 |
| 0.3435 | 0.344 | 0.429 | 0.995 | 0.72 | 0.95 |
| 0.344 | 0.344 | 0.429 | 0.995 | 0.72 | 0.95 |
| 0.3445 | 0.345 | 0.43 | 0.995 | 0.72 | 0.95 |
| 0.345 | 0.345 | 0.43 | 0.995 | 0.721 | 0.95 |
| 0.3455 | 0.346 | 0.431 | 0.995 | 0.721 | 0.95 |
| 0.346 | 0.346 | 0.431 | 0.995 | 0.721 | 0.95 |
| 0.3465 | 0.347 | 0.432 | 0.995 | 0.722 | 0.95 |
| 0.347 | 0.347 | 0.432 | 0.995 | 0.722 | 0.95 |
| 0.3475 | 0.348 | 0.432 | 0.995 | 0.722 | 0.95 |
| 0.348 | 0.348 | 0.433 | 0.995 | 0.722 | 0.95 |
| 0.3485 | 0.349 | 0.433 | 0.995 | 0.723 | 0.95 |
| 0.349 | 0.349 | 0.434 | 0.995 | 0.723 | 0.95 |
| 0.3495 | 0.35 | 0.434 | 0.995 | 0.723 | 0.951 |
| 0.35 | 0.35 | 0.435 | 0.995 | 0.723 | 0.951 |
| 0.3505 | 0.351 | 0.435 | 0.995 | 0.724 | 0.951 |
| 0.351 | 0.351 | 0.436 | 0.995 | 0.724 | 0.951 |
| 0.3515 | 0.352 | 0.436 | 0.995 | 0.724 | 0.951 |
| 0.352 | 0.352 | 0.437 | 0.995 | 0.724 | 0.951 |
| 0.3525 | 0.353 | 0.437 | 0.995 | 0.725 | 0.951 |
| 0.353 | 0.353 | 0.438 | 0.995 | 0.725 | 0.951 |
| 0.3535 | 0.354 | 0.438 | 0.995 | 0.725 | 0.951 |
| 0.354 | 0.354 | 0.438 | 0.995 | 0.726 | 0.951 |
| 0.3545 | 0.355 | 0.439 | 0.995 | 0.726 | 0.951 |
| 0.355 | 0.355 | 0.439 | 0.995 | 0.726 | 0.951 |
| 0.3555 | 0.356 | 0.44 | 0.995 | 0.726 | 0.951 |
| 0.356 | 0.356 | 0.44 | 0.995 | 0.727 | 0.951 |
| 0.3565 | 0.357 | 0.441 | 0.995 | 0.727 | 0.951 |
| 0.357 | 0.357 | 0.441 | 0.995 | 0.727 | 0.951 |
| 0.3575 | 0.358 | 0.442 | 0.995 | 0.727 | 0.951 |
| 0.358 | 0.358 | 0.442 | 0.995 | 0.728 | 0.951 |
| 0.3585 | 0.359 | 0.443 | 0.995 | 0.728 | 0.951 |
| 0.359 | 0.359 | 0.443 | 0.995 | 0.728 | 0.952 |
| 0.3595 | 0.36 | 0.444 | 0.995 | 0.729 | 0.952 |
| 0.36 | 0.36 | 0.444 | 0.995 | 0.729 | 0.952 |
| 0.3605 | 0.361 | 0.444 | 0.995 | 0.729 | 0.952 |
| 0.361 | 0.361 | 0.445 | 0.995 | 0.729 | 0.952 |
| 0.3615 | 0.362 | 0.445 | 0.995 | 0.73 | 0.952 |
| 0.362 | 0.362 | 0.446 | 0.995 | 0.73 | 0.952 |
| 0.3625 | 0.363 | 0.446 | 0.995 | 0.73 | 0.952 |
| 0.363 | 0.363 | 0.447 | 0.995 | 0.73 | 0.952 |
| 0.3635 | 0.364 | 0.447 | 0.995 | 0.731 | 0.952 |
| 0.364 | 0.364 | 0.448 | 0.995 | 0.731 | 0.952 |
| 0.3645 | 0.365 | 0.448 | 0.995 | 0.731 | 0.952 |
| 0.365 | 0.365 | 0.449 | 0.995 | 0.732 | 0.952 |
| 0.3655 | 0.366 | 0.449 | 0.995 | 0.732 | 0.952 |
| 0.366 | 0.366 | 0.45 | 0.995 | 0.732 | 0.952 |
| 0.3665 | 0.367 | 0.45 | 0.995 | 0.732 | 0.952 |
| 0.367 | 0.367 | 0.45 | 0.995 | 0.733 | 0.952 |
| 0.3675 | 0.368 | 0.451 | 0.995 | 0.733 | 0.952 |
| 0.368 | 0.368 | 0.451 | 0.995 | 0.733 | 0.953 |
| 0.3685 | 0.369 | 0.452 | 0.995 | 0.733 | 0.953 |
| 0.369 | 0.369 | 0.452 | 0.995 | 0.734 | 0.953 |
| 0.3695 | 0.37 | 0.453 | 0.995 | 0.734 | 0.953 |
| 0.37 | 0.37 | 0.453 | 0.995 | 0.734 | 0.953 |
| 0.3705 | 0.371 | 0.454 | 0.995 | 0.734 | 0.953 |
| 0.371 | 0.371 | 0.454 | 0.995 | 0.735 | 0.953 |
| 0.3715 | 0.372 | 0.455 | 0.995 | 0.735 | 0.953 |
| 0.372 | 0.372 | 0.455 | 0.995 | 0.735 | 0.953 |
| 0.3725 | 0.373 | 0.456 | 0.995 | 0.736 | 0.953 |
| 0.373 | 0.373 | 0.456 | 0.995 | 0.736 | 0.953 |
| 0.3735 | 0.374 | 0.456 | 0.995 | 0.736 | 0.953 |
| 0.374 | 0.374 | 0.457 | 0.995 | 0.736 | 0.953 |
| 0.3745 | 0.375 | 0.457 | 0.995 | 0.737 | 0.953 |
| 0.375 | 0.375 | 0.458 | 0.995 | 0.737 | 0.953 |
| 0.3755 | 0.376 | 0.458 | 0.995 | 0.737 | 0.953 |
| 0.376 | 0.376 | 0.459 | 0.995 | 0.737 | 0.953 |
| 0.3765 | 0.377 | 0.459 | 0.995 | 0.738 | 0.953 |
| 0.377 | 0.377 | 0.46 | 0.995 | 0.738 | 0.953 |
| 0.3775 | 0.378 | 0.46 | 0.995 | 0.738 | 0.954 |
| 0.378 | 0.378 | 0.461 | 0.995 | 0.738 | 0.954 |
| 0.3785 | 0.379 | 0.461 | 0.995 | 0.739 | 0.954 |
| 0.379 | 0.379 | 0.462 | 0.995 | 0.739 | 0.954 |
| 0.3795 | 0.38 | 0.462 | 0.995 | 0.739 | 0.954 |
| 0.38 | 0.38 | 0.462 | 0.995 | 0.739 | 0.954 |
| 0.3805 | 0.381 | 0.463 | 0.996 | 0.74 | 0.954 |
| 0.381 | 0.381 | 0.463 | 0.996 | 0.74 | 0.954 |
| 0.3815 | 0.382 | 0.464 | 0.996 | 0.74 | 0.954 |
| 0.382 | 0.382 | 0.464 | 0.996 | 0.741 | 0.954 |
| 0.3825 | 0.383 | 0.465 | 0.996 | 0.741 | 0.954 |
| 0.383 | 0.383 | 0.465 | 0.996 | 0.741 | 0.954 |
| 0.3835 | 0.384 | 0.466 | 0.996 | 0.741 | 0.954 |
| 0.384 | 0.384 | 0.466 | 0.996 | 0.742 | 0.954 |
| 0.3845 | 0.385 | 0.467 | 0.996 | 0.742 | 0.954 |
| 0.385 | 0.385 | 0.467 | 0.996 | 0.742 | 0.954 |
| 0.3855 | 0.386 | 0.467 | 0.996 | 0.742 | 0.954 |
| 0.386 | 0.386 | 0.468 | 0.996 | 0.743 | 0.954 |
| 0.3865 | 0.387 | 0.468 | 0.996 | 0.743 | 0.954 |
| 0.387 | 0.387 | 0.469 | 0.996 | 0.743 | 0.955 |
| 0.3875 | 0.388 | 0.469 | 0.996 | 0.743 | 0.955 |
| 0.388 | 0.388 | 0.47 | 0.996 | 0.744 | 0.955 |
| 0.3885 | 0.389 | 0.47 | 0.996 | 0.744 | 0.955 |
| 0.389 | 0.389 | 0.471 | 0.996 | 0.744 | 0.955 |
| 0.3895 | 0.39 | 0.471 | 0.996 | 0.745 | 0.955 |
| 0.39 | 0.39 | 0.472 | 0.996 | 0.745 | 0.955 |
| 0.3905 | 0.391 | 0.472 | 0.996 | 0.745 | 0.955 |
| 0.391 | 0.391 | 0.473 | 0.996 | 0.745 | 0.955 |
| 0.3915 | 0.392 | 0.473 | 0.996 | 0.746 | 0.955 |
| 0.392 | 0.392 | 0.473 | 0.996 | 0.746 | 0.955 |
| 0.3925 | 0.393 | 0.474 | 0.996 | 0.746 | 0.955 |
| 0.393 | 0.393 | 0.474 | 0.996 | 0.746 | 0.955 |
| 0.3935 | 0.394 | 0.475 | 0.996 | 0.747 | 0.955 |
| 0.394 | 0.394 | 0.475 | 0.996 | 0.747 | 0.955 |
| 0.3945 | 0.395 | 0.476 | 0.996 | 0.747 | 0.955 |
| 0.395 | 0.395 | 0.476 | 0.996 | 0.747 | 0.955 |
| 0.3955 | 0.396 | 0.477 | 0.996 | 0.748 | 0.955 |
| 0.396 | 0.396 | 0.477 | 0.996 | 0.748 | 0.955 |
| 0.3965 | 0.397 | 0.478 | 0.996 | 0.748 | 0.956 |
| 0.397 | 0.397 | 0.478 | 0.996 | 0.748 | 0.956 |
| 0.3975 | 0.398 | 0.478 | 0.996 | 0.749 | 0.956 |
| 0.398 | 0.398 | 0.479 | 0.996 | 0.749 | 0.956 |
| 0.3985 | 0.399 | 0.479 | 0.996 | 0.749 | 0.956 |
| 0.399 | 0.399 | 0.48 | 0.996 | 0.749 | 0.956 |
| 0.3995 | 0.4 | 0.48 | 0.996 | 0.75 | 0.956 |
| 0.4 | 0.4 | 0.481 | 0.996 | 0.75 | 0.956 |
| 0.4005 | 0.401 | 0.481 | 0.996 | 0.75 | 0.956 |
| 0.401 | 0.401 | 0.482 | 0.996 | 0.751 | 0.956 |
| 0.4015 | 0.402 | 0.482 | 0.996 | 0.751 | 0.956 |
| 0.402 | 0.402 | 0.483 | 0.996 | 0.751 | 0.956 |
| 0.4025 | 0.403 | 0.483 | 0.996 | 0.751 | 0.956 |
| 0.403 | 0.403 | 0.484 | 0.996 | 0.752 | 0.956 |
| 0.4035 | 0.404 | 0.484 | 0.996 | 0.752 | 0.956 |
| 0.404 | 0.404 | 0.484 | 0.996 | 0.752 | 0.956 |
| 0.4045 | 0.405 | 0.485 | 0.996 | 0.752 | 0.956 |
| 0.405 | 0.405 | 0.485 | 0.996 | 0.753 | 0.956 |
| 0.4055 | 0.406 | 0.486 | 0.996 | 0.753 | 0.956 |
| 0.406 | 0.406 | 0.486 | 0.996 | 0.753 | 0.956 |
| 0.4065 | 0.407 | 0.487 | 0.996 | 0.753 | 0.957 |
| 0.407 | 0.407 | 0.487 | 0.996 | 0.754 | 0.957 |
| 0.4075 | 0.408 | 0.488 | 0.996 | 0.754 | 0.957 |
| 0.408 | 0.408 | 0.488 | 0.996 | 0.754 | 0.957 |
| 0.4085 | 0.409 | 0.489 | 0.996 | 0.754 | 0.957 |
| 0.409 | 0.409 | 0.489 | 0.996 | 0.755 | 0.957 |
| 0.4095 | 0.41 | 0.489 | 0.996 | 0.755 | 0.957 |
| 0.41 | 0.41 | 0.49 | 0.996 | 0.755 | 0.957 |
| 0.4105 | 0.411 | 0.49 | 0.996 | 0.755 | 0.957 |
| 0.411 | 0.411 | 0.491 | 0.996 | 0.756 | 0.957 |
| 0.4115 | 0.412 | 0.491 | 0.996 | 0.756 | 0.957 |
| 0.412 | 0.412 | 0.492 | 0.996 | 0.756 | 0.957 |
| 0.4125 | 0.413 | 0.492 | 0.996 | 0.756 | 0.957 |
| 0.413 | 0.413 | 0.493 | 0.996 | 0.757 | 0.957 |
| 0.4135 | 0.414 | 0.493 | 0.996 | 0.757 | 0.957 |
| 0.414 | 0.414 | 0.494 | 0.996 | 0.757 | 0.957 |
| 0.4145 | 0.415 | 0.494 | 0.996 | 0.758 | 0.957 |
| 0.415 | 0.415 | 0.494 | 0.996 | 0.758 | 0.957 |
| 0.4155 | 0.416 | 0.495 | 0.996 | 0.758 | 0.957 |
| 0.416 | 0.416 | 0.495 | 0.996 | 0.758 | 0.958 |
| 0.4165 | 0.417 | 0.496 | 0.996 | 0.759 | 0.958 |
| 0.417 | 0.417 | 0.496 | 0.996 | 0.759 | 0.958 |
| 0.4175 | 0.418 | 0.497 | 0.996 | 0.759 | 0.958 |
| 0.418 | 0.418 | 0.497 | 0.996 | 0.759 | 0.958 |
| 0.4185 | 0.419 | 0.498 | 0.996 | 0.76 | 0.958 |
| 0.419 | 0.419 | 0.498 | 0.996 | 0.76 | 0.958 |
| 0.4195 | 0.42 | 0.499 | 0.996 | 0.76 | 0.958 |
| 0.42 | 0.42 | 0.499 | 0.996 | 0.76 | 0.958 |
| 0.4205 | 0.421 | 0.499 | 0.996 | 0.761 | 0.958 |
| 0.421 | 0.421 | 0.5 | 0.996 | 0.761 | 0.958 |
| 0.4215 | 0.422 | 0.5 | 0.996 | 0.761 | 0.958 |
| 0.422 | 0.422 | 0.501 | 0.996 | 0.761 | 0.958 |
| 0.4225 | 0.423 | 0.501 | 0.996 | 0.762 | 0.958 |
| 0.423 | 0.423 | 0.502 | 0.996 | 0.762 | 0.958 |
| 0.4235 | 0.424 | 0.502 | 0.996 | 0.762 | 0.958 |
| 0.424 | 0.424 | 0.503 | 0.996 | 0.762 | 0.958 |
| 0.4245 | 0.425 | 0.503 | 0.996 | 0.763 | 0.958 |
| 0.425 | 0.425 | 0.504 | 0.996 | 0.763 | 0.958 |
| 0.4255 | 0.426 | 0.504 | 0.996 | 0.763 | 0.958 |
| 0.426 | 0.426 | 0.505 | 0.996 | 0.763 | 0.959 |
| 0.4265 | 0.427 | 0.505 | 0.996 | 0.764 | 0.959 |
| 0.427 | 0.427 | 0.505 | 0.996 | 0.764 | 0.959 |
| 0.4275 | 0.428 | 0.506 | 0.996 | 0.764 | 0.959 |
| 0.428 | 0.428 | 0.506 | 0.996 | 0.764 | 0.959 |
| 0.4285 | 0.429 | 0.507 | 0.996 | 0.765 | 0.959 |
| 0.429 | 0.429 | 0.507 | 0.996 | 0.765 | 0.959 |
| 0.4295 | 0.43 | 0.508 | 0.996 | 0.765 | 0.959 |
| 0.43 | 0.43 | 0.508 | 0.996 | 0.765 | 0.959 |
| 0.4305 | 0.431 | 0.509 | 0.996 | 0.766 | 0.959 |
| 0.431 | 0.431 | 0.509 | 0.996 | 0.766 | 0.959 |
| 0.4315 | 0.432 | 0.51 | 0.996 | 0.766 | 0.959 |
| 0.432 | 0.432 | 0.51 | 0.996 | 0.766 | 0.959 |
| 0.4325 | 0.433 | 0.51 | 0.996 | 0.767 | 0.959 |
| 0.433 | 0.433 | 0.511 | 0.996 | 0.767 | 0.959 |
| 0.4335 | 0.434 | 0.511 | 0.996 | 0.767 | 0.959 |
| 0.434 | 0.434 | 0.512 | 0.996 | 0.767 | 0.959 |
| 0.4345 | 0.435 | 0.512 | 0.996 | 0.768 | 0.959 |
| 0.435 | 0.435 | 0.513 | 0.996 | 0.768 | 0.959 |
| 0.4355 | 0.436 | 0.513 | 0.996 | 0.768 | 0.959 |
| 0.436 | 0.436 | 0.514 | 0.996 | 0.768 | 0.959 |
| 0.4365 | 0.437 | 0.514 | 0.996 | 0.769 | 0.96 |
| 0.437 | 0.437 | 0.515 | 0.996 | 0.769 | 0.96 |
| 0.4375 | 0.438 | 0.515 | 0.996 | 0.769 | 0.96 |
| 0.438 | 0.438 | 0.515 | 0.996 | 0.769 | 0.96 |
| 0.4385 | 0.439 | 0.516 | 0.996 | 0.77 | 0.96 |
| 0.439 | 0.439 | 0.516 | 0.996 | 0.77 | 0.96 |
| 0.4395 | 0.44 | 0.517 | 0.996 | 0.77 | 0.96 |
| 0.44 | 0.44 | 0.517 | 0.996 | 0.77 | 0.96 |
| 0.4405 | 0.441 | 0.518 | 0.996 | 0.771 | 0.96 |
| 0.441 | 0.441 | 0.518 | 0.996 | 0.771 | 0.96 |
| 0.4415 | 0.442 | 0.519 | 0.996 | 0.771 | 0.96 |
| 0.442 | 0.442 | 0.519 | 0.996 | 0.771 | 0.96 |
| 0.4425 | 0.443 | 0.52 | 0.996 | 0.772 | 0.96 |
| 0.443 | 0.443 | 0.52 | 0.996 | 0.772 | 0.96 |
| 0.4435 | 0.444 | 0.52 | 0.996 | 0.772 | 0.96 |
| 0.444 | 0.444 | 0.521 | 0.996 | 0.773 | 0.96 |
| 0.4445 | 0.445 | 0.521 | 0.996 | 0.773 | 0.96 |
| 0.445 | 0.445 | 0.522 | 0.996 | 0.773 | 0.96 |
| 0.4455 | 0.446 | 0.522 | 0.996 | 0.773 | 0.96 |
| 0.446 | 0.446 | 0.523 | 0.996 | 0.774 | 0.96 |
| 0.4465 | 0.447 | 0.523 | 0.996 | 0.774 | 0.961 |
| 0.447 | 0.447 | 0.524 | 0.996 | 0.774 | 0.961 |
| 0.4475 | 0.448 | 0.524 | 0.996 | 0.774 | 0.961 |
| 0.448 | 0.448 | 0.525 | 0.996 | 0.775 | 0.961 |
| 0.4485 | 0.449 | 0.525 | 0.996 | 0.775 | 0.961 |
| 0.449 | 0.449 | 0.525 | 0.996 | 0.775 | 0.961 |
| 0.4495 | 0.45 | 0.526 | 0.996 | 0.775 | 0.961 |
| 0.45 | 0.45 | 0.526 | 0.996 | 0.776 | 0.961 |
| 0.4505 | 0.451 | 0.527 | 0.996 | 0.776 | 0.961 |
| 0.451 | 0.451 | 0.527 | 0.996 | 0.776 | 0.961 |
| 0.4515 | 0.452 | 0.528 | 0.996 | 0.776 | 0.961 |
| 0.452 | 0.452 | 0.528 | 0.996 | 0.777 | 0.961 |
| 0.4525 | 0.453 | 0.529 | 0.996 | 0.777 | 0.961 |
| 0.453 | 0.453 | 0.529 | 0.996 | 0.777 | 0.961 |
| 0.4535 | 0.454 | 0.529 | 0.996 | 0.777 | 0.961 |
| 0.454 | 0.454 | 0.53 | 0.996 | 0.778 | 0.961 |
| 0.4545 | 0.455 | 0.53 | 0.996 | 0.778 | 0.961 |
| 0.455 | 0.455 | 0.531 | 0.996 | 0.778 | 0.961 |
| 0.4555 | 0.456 | 0.531 | 0.996 | 0.778 | 0.961 |
| 0.456 | 0.456 | 0.532 | 0.996 | 0.779 | 0.961 |
| 0.4565 | 0.457 | 0.532 | 0.996 | 0.779 | 0.961 |
| 0.457 | 0.457 | 0.533 | 0.996 | 0.779 | 0.962 |
| 0.4575 | 0.458 | 0.533 | 0.996 | 0.779 | 0.962 |
| 0.458 | 0.458 | 0.534 | 0.996 | 0.779 | 0.962 |
| 0.4585 | 0.459 | 0.534 | 0.996 | 0.78 | 0.962 |
| 0.459 | 0.459 | 0.534 | 0.996 | 0.78 | 0.962 |
| 0.4595 | 0.46 | 0.535 | 0.996 | 0.78 | 0.962 |
| 0.46 | 0.46 | 0.535 | 0.996 | 0.78 | 0.962 |
| 0.4605 | 0.461 | 0.536 | 0.996 | 0.781 | 0.962 |
| 0.461 | 0.461 | 0.536 | 0.996 | 0.781 | 0.962 |
| 0.4615 | 0.462 | 0.537 | 0.996 | 0.781 | 0.962 |
| 0.462 | 0.462 | 0.537 | 0.996 | 0.781 | 0.962 |
| 0.4625 | 0.463 | 0.538 | 0.996 | 0.782 | 0.962 |
| 0.463 | 0.463 | 0.538 | 0.996 | 0.782 | 0.962 |
| 0.4635 | 0.464 | 0.539 | 0.996 | 0.782 | 0.962 |
| 0.464 | 0.464 | 0.539 | 0.996 | 0.782 | 0.962 |
| 0.4645 | 0.465 | 0.539 | 0.996 | 0.783 | 0.962 |
| 0.465 | 0.465 | 0.54 | 0.996 | 0.783 | 0.962 |
| 0.4655 | 0.466 | 0.54 | 0.996 | 0.783 | 0.962 |
| 0.466 | 0.466 | 0.541 | 0.996 | 0.783 | 0.962 |
| 0.4665 | 0.467 | 0.541 | 0.996 | 0.784 | 0.962 |
| 0.467 | 0.467 | 0.542 | 0.996 | 0.784 | 0.962 |
| 0.4675 | 0.468 | 0.542 | 0.996 | 0.784 | 0.963 |
| 0.468 | 0.468 | 0.543 | 0.996 | 0.784 | 0.963 |
| 0.4685 | 0.469 | 0.543 | 0.996 | 0.785 | 0.963 |
| 0.469 | 0.469 | 0.544 | 0.996 | 0.785 | 0.963 |
| 0.4695 | 0.47 | 0.544 | 0.996 | 0.785 | 0.963 |
| 0.47 | 0.47 | 0.544 | 0.996 | 0.785 | 0.963 |
| 0.4705 | 0.471 | 0.545 | 0.996 | 0.786 | 0.963 |
| 0.471 | 0.471 | 0.545 | 0.996 | 0.786 | 0.963 |
| 0.4715 | 0.472 | 0.546 | 0.996 | 0.786 | 0.963 |
| 0.472 | 0.472 | 0.546 | 0.996 | 0.786 | 0.963 |
| 0.4725 | 0.473 | 0.547 | 0.996 | 0.787 | 0.963 |
| 0.473 | 0.473 | 0.547 | 0.996 | 0.787 | 0.963 |
| 0.4735 | 0.474 | 0.548 | 0.996 | 0.787 | 0.963 |
| 0.474 | 0.474 | 0.548 | 0.996 | 0.787 | 0.963 |
| 0.4745 | 0.475 | 0.548 | 0.996 | 0.788 | 0.963 |
| 0.475 | 0.475 | 0.549 | 0.996 | 0.788 | 0.963 |
| 0.4755 | 0.476 | 0.549 | 0.996 | 0.788 | 0.963 |
| 0.476 | 0.476 | 0.55 | 0.996 | 0.788 | 0.963 |
| 0.4765 | 0.477 | 0.55 | 0.996 | 0.789 | 0.963 |
| 0.477 | 0.477 | 0.551 | 0.996 | 0.789 | 0.963 |
| 0.4775 | 0.478 | 0.551 | 0.996 | 0.789 | 0.963 |
| 0.478 | 0.478 | 0.552 | 0.996 | 0.789 | 0.964 |
| 0.4785 | 0.479 | 0.552 | 0.996 | 0.79 | 0.964 |
| 0.479 | 0.479 | 0.553 | 0.996 | 0.79 | 0.964 |
| 0.4795 | 0.48 | 0.553 | 0.996 | 0.79 | 0.964 |
| 0.48 | 0.48 | 0.553 | 0.996 | 0.79 | 0.964 |
| 0.4805 | 0.481 | 0.554 | 0.996 | 0.791 | 0.964 |
| 0.481 | 0.481 | 0.554 | 0.996 | 0.791 | 0.964 |
| 0.4815 | 0.482 | 0.555 | 0.996 | 0.791 | 0.964 |
| 0.482 | 0.482 | 0.555 | 0.996 | 0.791 | 0.964 |
| 0.4825 | 0.483 | 0.556 | 0.996 | 0.792 | 0.964 |
| 0.483 | 0.483 | 0.556 | 0.997 | 0.792 | 0.964 |
| 0.4835 | 0.484 | 0.557 | 0.997 | 0.792 | 0.964 |
| 0.484 | 0.484 | 0.557 | 0.997 | 0.792 | 0.964 |
| 0.4845 | 0.485 | 0.557 | 0.997 | 0.793 | 0.964 |
| 0.485 | 0.485 | 0.558 | 0.997 | 0.793 | 0.964 |
| 0.4855 | 0.486 | 0.558 | 0.997 | 0.793 | 0.964 |
| 0.486 | 0.486 | 0.559 | 0.997 | 0.793 | 0.964 |
| 0.4865 | 0.487 | 0.559 | 0.997 | 0.793 | 0.964 |
| 0.487 | 0.487 | 0.56 | 0.997 | 0.794 | 0.964 |
| 0.4875 | 0.488 | 0.56 | 0.997 | 0.794 | 0.964 |
| 0.488 | 0.488 | 0.561 | 0.997 | 0.794 | 0.964 |
| 0.4885 | 0.489 | 0.561 | 0.997 | 0.794 | 0.964 |
| 0.489 | 0.489 | 0.562 | 0.997 | 0.795 | 0.965 |
| 0.4895 | 0.49 | 0.562 | 0.997 | 0.795 | 0.965 |
| 0.49 | 0.49 | 0.562 | 0.997 | 0.795 | 0.965 |
| 0.4905 | 0.491 | 0.563 | 0.997 | 0.795 | 0.965 |
| 0.491 | 0.491 | 0.563 | 0.997 | 0.796 | 0.965 |
| 0.4915 | 0.492 | 0.564 | 0.997 | 0.796 | 0.965 |
| 0.492 | 0.492 | 0.564 | 0.997 | 0.796 | 0.965 |
| 0.4925 | 0.493 | 0.565 | 0.997 | 0.796 | 0.965 |
| 0.493 | 0.493 | 0.565 | 0.997 | 0.797 | 0.965 |
| 0.4935 | 0.494 | 0.566 | 0.997 | 0.797 | 0.965 |
| 0.494 | 0.494 | 0.566 | 0.997 | 0.797 | 0.965 |
| 0.4945 | 0.495 | 0.566 | 0.997 | 0.797 | 0.965 |
| 0.495 | 0.495 | 0.567 | 0.997 | 0.798 | 0.965 |
| 0.4955 | 0.496 | 0.567 | 0.997 | 0.798 | 0.965 |
| 0.496 | 0.496 | 0.568 | 0.997 | 0.798 | 0.965 |
| 0.4965 | 0.497 | 0.568 | 0.997 | 0.798 | 0.965 |
| 0.497 | 0.497 | 0.569 | 0.997 | 0.799 | 0.965 |
| 0.4975 | 0.498 | 0.569 | 0.997 | 0.799 | 0.965 |
| 0.498 | 0.498 | 0.57 | 0.997 | 0.799 | 0.965 |
| 0.4985 | 0.499 | 0.57 | 0.997 | 0.799 | 0.965 |
| 0.499 | 0.499 | 0.571 | 0.997 | 0.8 | 0.965 |
| 0.4995 | 0.5 | 0.571 | 0.997 | 0.8 | 0.965 |
| 0.5 | 0.5 | 0.571 | 0.997 | 0.8 | 0.966 |
| 0.5005 | 0.501 | 0.572 | 0.997 | 0.8 | 0.966 |
| 0.501 | 0.501 | 0.572 | 0.997 | 0.8 | 0.966 |
| 0.5015 | 0.502 | 0.573 | 0.997 | 0.801 | 0.966 |
| 0.502 | 0.502 | 0.573 | 0.997 | 0.801 | 0.966 |
| 0.5025 | 0.503 | 0.574 | 0.997 | 0.801 | 0.966 |
| 0.503 | 0.503 | 0.574 | 0.997 | 0.801 | 0.966 |
| 0.5035 | 0.504 | 0.575 | 0.997 | 0.802 | 0.966 |
| 0.504 | 0.504 | 0.575 | 0.997 | 0.802 | 0.966 |
| 0.5045 | 0.505 | 0.575 | 0.997 | 0.802 | 0.966 |
| 0.505 | 0.505 | 0.576 | 0.997 | 0.802 | 0.966 |
| 0.5055 | 0.506 | 0.576 | 0.997 | 0.803 | 0.966 |
| 0.506 | 0.506 | 0.577 | 0.997 | 0.803 | 0.966 |
| 0.5065 | 0.507 | 0.577 | 0.997 | 0.803 | 0.966 |
| 0.507 | 0.507 | 0.578 | 0.997 | 0.803 | 0.966 |
| 0.5075 | 0.508 | 0.578 | 0.997 | 0.804 | 0.966 |
| 0.507999999999999 | 0.508 | 0.579 | 0.997 | 0.804 | 0.966 |
| 0.508499999999999 | 0.509 | 0.579 | 0.997 | 0.804 | 0.966 |
| 0.508999999999999 | 0.509 | 0.58 | 0.997 | 0.804 | 0.966 |
| 0.509499999999999 | 0.51 | 0.58 | 0.997 | 0.805 | 0.966 |
| 0.509999999999999 | 0.51 | 0.58 | 0.997 | 0.805 | 0.966 |
| 0.510499999999999 | 0.511 | 0.581 | 0.997 | 0.805 | 0.966 |
| 0.510999999999999 | 0.511 | 0.581 | 0.997 | 0.805 | 0.967 |
| 0.511499999999999 | 0.512 | 0.582 | 0.997 | 0.805 | 0.967 |
| 0.511999999999999 | 0.512 | 0.582 | 0.997 | 0.806 | 0.967 |
| 0.512499999999999 | 0.513 | 0.583 | 0.997 | 0.806 | 0.967 |
| 0.512999999999999 | 0.513 | 0.583 | 0.997 | 0.806 | 0.967 |
| 0.513499999999999 | 0.514 | 0.584 | 0.997 | 0.806 | 0.967 |
| 0.513999999999999 | 0.514 | 0.584 | 0.997 | 0.807 | 0.967 |
| 0.514499999999999 | 0.515 | 0.584 | 0.997 | 0.807 | 0.967 |
| 0.514999999999999 | 0.515 | 0.585 | 0.997 | 0.807 | 0.967 |
| 0.515499999999999 | 0.516 | 0.585 | 0.997 | 0.807 | 0.967 |
| 0.515999999999999 | 0.516 | 0.586 | 0.997 | 0.808 | 0.967 |
| 0.516499999999999 | 0.517 | 0.586 | 0.997 | 0.808 | 0.967 |
| 0.516999999999998 | 0.517 | 0.587 | 0.997 | 0.808 | 0.967 |
| 0.517499999999998 | 0.518 | 0.587 | 0.997 | 0.808 | 0.967 |
| 0.517999999999998 | 0.518 | 0.588 | 0.997 | 0.809 | 0.967 |
| 0.518499999999998 | 0.519 | 0.588 | 0.997 | 0.809 | 0.967 |
| 0.518999999999998 | 0.519 | 0.588 | 0.997 | 0.809 | 0.967 |
| 0.519499999999998 | 0.52 | 0.589 | 0.997 | 0.809 | 0.967 |
| 0.519999999999998 | 0.52 | 0.589 | 0.997 | 0.81 | 0.967 |
| 0.520499999999998 | 0.521 | 0.59 | 0.997 | 0.81 | 0.967 |
| 0.520999999999998 | 0.521 | 0.59 | 0.997 | 0.81 | 0.967 |
| 0.521499999999998 | 0.522 | 0.591 | 0.997 | 0.81 | 0.967 |
| 0.521999999999998 | 0.522 | 0.591 | 0.997 | 0.81 | 0.967 |
| 0.522499999999998 | 0.523 | 0.592 | 0.997 | 0.811 | 0.968 |
| 0.522999999999998 | 0.523 | 0.592 | 0.997 | 0.811 | 0.968 |
| 0.523499999999998 | 0.524 | 0.592 | 0.997 | 0.811 | 0.968 |
| 0.523999999999998 | 0.524 | 0.593 | 0.997 | 0.811 | 0.968 |
| 0.524499999999998 | 0.525 | 0.593 | 0.997 | 0.812 | 0.968 |
| 0.524999999999998 | 0.525 | 0.594 | 0.997 | 0.812 | 0.968 |
| 0.525499999999998 | 0.526 | 0.594 | 0.997 | 0.812 | 0.968 |
| 0.525999999999997 | 0.526 | 0.595 | 0.997 | 0.812 | 0.968 |
| 0.526499999999997 | 0.527 | 0.595 | 0.997 | 0.813 | 0.968 |
| 0.526999999999997 | 0.527 | 0.596 | 0.997 | 0.813 | 0.968 |
| 0.527499999999997 | 0.528 | 0.596 | 0.997 | 0.813 | 0.968 |
| 0.527999999999997 | 0.528 | 0.597 | 0.997 | 0.813 | 0.968 |
| 0.528499999999997 | 0.529 | 0.597 | 0.997 | 0.814 | 0.968 |
| 0.528999999999997 | 0.529 | 0.597 | 0.997 | 0.814 | 0.968 |
| 0.529499999999997 | 0.53 | 0.598 | 0.997 | 0.814 | 0.968 |
| 0.529999999999997 | 0.53 | 0.598 | 0.997 | 0.814 | 0.968 |
| 0.530499999999997 | 0.531 | 0.599 | 0.997 | 0.814 | 0.968 |
| 0.530999999999997 | 0.531 | 0.599 | 0.997 | 0.815 | 0.968 |
| 0.531499999999997 | 0.532 | 0.6 | 0.997 | 0.815 | 0.968 |
| 0.531999999999997 | 0.532 | 0.6 | 0.997 | 0.815 | 0.968 |
| 0.532499999999997 | 0.533 | 0.601 | 0.997 | 0.815 | 0.968 |
| 0.532999999999997 | 0.533 | 0.601 | 0.997 | 0.816 | 0.968 |
| 0.533499999999997 | 0.534 | 0.601 | 0.997 | 0.816 | 0.968 |
| 0.533999999999997 | 0.534 | 0.602 | 0.997 | 0.816 | 0.969 |
| 0.534499999999997 | 0.535 | 0.602 | 0.997 | 0.816 | 0.969 |
| 0.534999999999996 | 0.535 | 0.603 | 0.997 | 0.817 | 0.969 |
| 0.535499999999996 | 0.536 | 0.603 | 0.997 | 0.817 | 0.969 |
| 0.535999999999996 | 0.536 | 0.604 | 0.997 | 0.817 | 0.969 |
| 0.536499999999996 | 0.537 | 0.604 | 0.997 | 0.817 | 0.969 |
| 0.536999999999996 | 0.537 | 0.605 | 0.997 | 0.818 | 0.969 |
| 0.537499999999996 | 0.538 | 0.605 | 0.997 | 0.818 | 0.969 |
| 0.537999999999996 | 0.538 | 0.605 | 0.997 | 0.818 | 0.969 |
| 0.538499999999996 | 0.539 | 0.606 | 0.997 | 0.818 | 0.969 |
| 0.538999999999996 | 0.539 | 0.606 | 0.997 | 0.818 | 0.969 |
| 0.539499999999996 | 0.54 | 0.607 | 0.997 | 0.819 | 0.969 |
| 0.539999999999996 | 0.54 | 0.607 | 0.997 | 0.819 | 0.969 |
| 0.540499999999996 | 0.541 | 0.608 | 0.997 | 0.819 | 0.969 |
| 0.540999999999996 | 0.541 | 0.608 | 0.997 | 0.819 | 0.969 |
| 0.541499999999996 | 0.542 | 0.609 | 0.997 | 0.82 | 0.969 |
| 0.541999999999996 | 0.542 | 0.609 | 0.997 | 0.82 | 0.969 |
| 0.542499999999996 | 0.543 | 0.609 | 0.997 | 0.82 | 0.969 |
| 0.542999999999996 | 0.543 | 0.61 | 0.997 | 0.82 | 0.969 |
| 0.543499999999996 | 0.544 | 0.61 | 0.997 | 0.821 | 0.969 |
| 0.543999999999995 | 0.544 | 0.611 | 0.997 | 0.821 | 0.969 |
| 0.544499999999995 | 0.545 | 0.611 | 0.997 | 0.821 | 0.969 |
| 0.544999999999995 | 0.545 | 0.612 | 0.997 | 0.821 | 0.969 |
| 0.545499999999995 | 0.546 | 0.612 | 0.997 | 0.821 | 0.97 |
| 0.545999999999995 | 0.546 | 0.613 | 0.997 | 0.822 | 0.97 |
| 0.546499999999995 | 0.547 | 0.613 | 0.997 | 0.822 | 0.97 |
| 0.546999999999995 | 0.547 | 0.613 | 0.997 | 0.822 | 0.97 |
| 0.547499999999995 | 0.548 | 0.614 | 0.997 | 0.822 | 0.97 |
| 0.547999999999995 | 0.548 | 0.614 | 0.997 | 0.823 | 0.97 |
| 0.548499999999995 | 0.549 | 0.615 | 0.997 | 0.823 | 0.97 |
| 0.548999999999995 | 0.549 | 0.615 | 0.997 | 0.823 | 0.97 |
| 0.549499999999995 | 0.55 | 0.616 | 0.997 | 0.823 | 0.97 |
| 0.549999999999995 | 0.55 | 0.616 | 0.997 | 0.824 | 0.97 |
| 0.550499999999995 | 0.551 | 0.617 | 0.997 | 0.824 | 0.97 |
| 0.550999999999995 | 0.551 | 0.617 | 0.997 | 0.824 | 0.97 |
| 0.551499999999995 | 0.552 | 0.617 | 0.997 | 0.824 | 0.97 |
| 0.551999999999995 | 0.552 | 0.618 | 0.997 | 0.824 | 0.97 |
| 0.552499999999995 | 0.553 | 0.618 | 0.997 | 0.825 | 0.97 |
| 0.552999999999994 | 0.553 | 0.619 | 0.997 | 0.825 | 0.97 |
| 0.553499999999994 | 0.554 | 0.619 | 0.997 | 0.825 | 0.97 |
| 0.553999999999994 | 0.554 | 0.62 | 0.997 | 0.825 | 0.97 |
| 0.554499999999994 | 0.555 | 0.62 | 0.997 | 0.826 | 0.97 |
| 0.554999999999994 | 0.555 | 0.621 | 0.997 | 0.826 | 0.97 |
| 0.555499999999994 | 0.556 | 0.621 | 0.997 | 0.826 | 0.97 |
| 0.555999999999994 | 0.556 | 0.621 | 0.997 | 0.826 | 0.97 |
| 0.556499999999994 | 0.557 | 0.622 | 0.997 | 0.827 | 0.97 |
| 0.556999999999994 | 0.557 | 0.622 | 0.997 | 0.827 | 0.97 |
| 0.557499999999994 | 0.558 | 0.623 | 0.997 | 0.827 | 0.971 |
| 0.557999999999994 | 0.558 | 0.623 | 0.997 | 0.827 | 0.971 |
| 0.558499999999994 | 0.559 | 0.624 | 0.997 | 0.827 | 0.971 |
| 0.558999999999994 | 0.559 | 0.624 | 0.997 | 0.828 | 0.971 |
| 0.559499999999994 | 0.56 | 0.625 | 0.997 | 0.828 | 0.971 |
| 0.559999999999994 | 0.56 | 0.625 | 0.997 | 0.828 | 0.971 |
| 0.560499999999994 | 0.561 | 0.625 | 0.997 | 0.828 | 0.971 |
| 0.560999999999994 | 0.561 | 0.626 | 0.997 | 0.829 | 0.971 |
| 0.561499999999994 | 0.562 | 0.626 | 0.997 | 0.829 | 0.971 |
| 0.561999999999993 | 0.562 | 0.627 | 0.997 | 0.829 | 0.971 |
| 0.562499999999993 | 0.563 | 0.627 | 0.997 | 0.829 | 0.971 |
| 0.562999999999993 | 0.563 | 0.628 | 0.997 | 0.829 | 0.971 |
| 0.563499999999993 | 0.564 | 0.628 | 0.997 | 0.83 | 0.971 |
| 0.563999999999993 | 0.564 | 0.629 | 0.997 | 0.83 | 0.971 |
| 0.564499999999993 | 0.565 | 0.629 | 0.997 | 0.83 | 0.971 |
| 0.564999999999993 | 0.565 | 0.629 | 0.997 | 0.83 | 0.971 |
| 0.565499999999993 | 0.566 | 0.63 | 0.997 | 0.831 | 0.971 |
| 0.565999999999993 | 0.566 | 0.63 | 0.997 | 0.831 | 0.971 |
| 0.566499999999993 | 0.567 | 0.631 | 0.997 | 0.831 | 0.971 |
| 0.566999999999993 | 0.567 | 0.631 | 0.997 | 0.831 | 0.971 |
| 0.567499999999993 | 0.568 | 0.632 | 0.997 | 0.832 | 0.971 |
| 0.567999999999993 | 0.568 | 0.632 | 0.997 | 0.832 | 0.971 |
| 0.568499999999993 | 0.569 | 0.633 | 0.997 | 0.832 | 0.971 |
| 0.568999999999993 | 0.569 | 0.633 | 0.997 | 0.832 | 0.971 |
| 0.569499999999993 | 0.57 | 0.633 | 0.997 | 0.832 | 0.972 |
| 0.569999999999993 | 0.57 | 0.634 | 0.997 | 0.833 | 0.972 |
| 0.570499999999993 | 0.571 | 0.634 | 0.997 | 0.833 | 0.972 |
| 0.570999999999993 | 0.571 | 0.635 | 0.997 | 0.833 | 0.972 |
| 0.571499999999992 | 0.572 | 0.635 | 0.997 | 0.833 | 0.972 |
| 0.571999999999992 | 0.572 | 0.636 | 0.997 | 0.834 | 0.972 |
| 0.572499999999992 | 0.573 | 0.636 | 0.997 | 0.834 | 0.972 |
| 0.572999999999992 | 0.573 | 0.637 | 0.997 | 0.834 | 0.972 |
| 0.573499999999992 | 0.574 | 0.637 | 0.997 | 0.834 | 0.972 |
| 0.573999999999992 | 0.574 | 0.637 | 0.997 | 0.834 | 0.972 |
| 0.574499999999992 | 0.575 | 0.638 | 0.997 | 0.835 | 0.972 |
| 0.574999999999992 | 0.575 | 0.638 | 0.997 | 0.835 | 0.972 |
| 0.575499999999992 | 0.576 | 0.639 | 0.997 | 0.835 | 0.972 |
| 0.575999999999992 | 0.576 | 0.639 | 0.997 | 0.835 | 0.972 |
| 0.576499999999992 | 0.577 | 0.64 | 0.997 | 0.836 | 0.972 |
| 0.576999999999992 | 0.577 | 0.64 | 0.997 | 0.836 | 0.972 |
| 0.577499999999992 | 0.578 | 0.641 | 0.997 | 0.836 | 0.972 |
| 0.577999999999992 | 0.578 | 0.641 | 0.997 | 0.836 | 0.972 |
| 0.578499999999992 | 0.579 | 0.641 | 0.997 | 0.837 | 0.972 |
| 0.578999999999992 | 0.579 | 0.642 | 0.997 | 0.837 | 0.972 |
| 0.579499999999992 | 0.58 | 0.642 | 0.997 | 0.837 | 0.972 |
| 0.579999999999992 | 0.58 | 0.643 | 0.997 | 0.837 | 0.972 |
| 0.580499999999991 | 0.581 | 0.643 | 0.997 | 0.837 | 0.972 |
| 0.580999999999991 | 0.581 | 0.644 | 0.997 | 0.838 | 0.972 |
| 0.581499999999991 | 0.582 | 0.644 | 0.997 | 0.838 | 0.973 |
| 0.581999999999991 | 0.582 | 0.644 | 0.997 | 0.838 | 0.973 |
| 0.582499999999991 | 0.583 | 0.645 | 0.997 | 0.838 | 0.973 |
| 0.582999999999991 | 0.583 | 0.645 | 0.997 | 0.839 | 0.973 |
| 0.583499999999991 | 0.584 | 0.646 | 0.997 | 0.839 | 0.973 |
| 0.583999999999991 | 0.584 | 0.646 | 0.997 | 0.839 | 0.973 |
| 0.584499999999991 | 0.585 | 0.647 | 0.997 | 0.839 | 0.973 |
| 0.584999999999991 | 0.585 | 0.647 | 0.997 | 0.839 | 0.973 |
| 0.585499999999991 | 0.586 | 0.648 | 0.997 | 0.84 | 0.973 |
| 0.585999999999991 | 0.586 | 0.648 | 0.997 | 0.84 | 0.973 |
| 0.586499999999991 | 0.587 | 0.648 | 0.997 | 0.84 | 0.973 |
| 0.586999999999991 | 0.587 | 0.649 | 0.997 | 0.84 | 0.973 |
| 0.587499999999991 | 0.588 | 0.649 | 0.997 | 0.841 | 0.973 |
| 0.587999999999991 | 0.588 | 0.65 | 0.997 | 0.841 | 0.973 |
| 0.588499999999991 | 0.589 | 0.65 | 0.997 | 0.841 | 0.973 |
| 0.588999999999991 | 0.589 | 0.651 | 0.997 | 0.841 | 0.973 |
| 0.58949999999999 | 0.59 | 0.651 | 0.997 | 0.841 | 0.973 |
| 0.58999999999999 | 0.59 | 0.652 | 0.997 | 0.842 | 0.973 |
| 0.59049999999999 | 0.591 | 0.652 | 0.997 | 0.842 | 0.973 |
| 0.59099999999999 | 0.591 | 0.652 | 0.997 | 0.842 | 0.973 |
| 0.59149999999999 | 0.592 | 0.653 | 0.997 | 0.842 | 0.973 |
| 0.59199999999999 | 0.592 | 0.653 | 0.997 | 0.843 | 0.973 |
| 0.59249999999999 | 0.593 | 0.654 | 0.997 | 0.843 | 0.973 |
| 0.59299999999999 | 0.593 | 0.654 | 0.997 | 0.843 | 0.973 |
| 0.59349999999999 | 0.594 | 0.655 | 0.997 | 0.843 | 0.974 |
| 0.59399999999999 | 0.594 | 0.655 | 0.997 | 0.843 | 0.974 |
| 0.59449999999999 | 0.595 | 0.656 | 0.997 | 0.844 | 0.974 |
| 0.59499999999999 | 0.595 | 0.656 | 0.997 | 0.844 | 0.974 |
| 0.59549999999999 | 0.596 | 0.656 | 0.997 | 0.844 | 0.974 |
| 0.59599999999999 | 0.596 | 0.657 | 0.997 | 0.844 | 0.974 |
| 0.59649999999999 | 0.597 | 0.657 | 0.997 | 0.845 | 0.974 |
| 0.59699999999999 | 0.597 | 0.658 | 0.997 | 0.845 | 0.974 |
| 0.59749999999999 | 0.598 | 0.658 | 0.997 | 0.845 | 0.974 |
| 0.59799999999999 | 0.598 | 0.659 | 0.997 | 0.845 | 0.974 |
| 0.598499999999989 | 0.599 | 0.659 | 0.997 | 0.845 | 0.974 |
| 0.598999999999989 | 0.599 | 0.659 | 0.997 | 0.846 | 0.974 |
| 0.599499999999989 | 0.6 | 0.66 | 0.997 | 0.846 | 0.974 |
| 0.599999999999989 | 0.6 | 0.66 | 0.997 | 0.846 | 0.974 |
| 0.600499999999989 | 0.601 | 0.661 | 0.997 | 0.846 | 0.974 |
| 0.600999999999989 | 0.601 | 0.661 | 0.997 | 0.847 | 0.974 |
| 0.601499999999989 | 0.602 | 0.662 | 0.998 | 0.847 | 0.974 |
| 0.601999999999989 | 0.602 | 0.662 | 0.998 | 0.847 | 0.974 |
| 0.602499999999989 | 0.603 | 0.663 | 0.998 | 0.847 | 0.974 |
| 0.602999999999989 | 0.603 | 0.663 | 0.998 | 0.847 | 0.974 |
| 0.603499999999989 | 0.604 | 0.663 | 0.998 | 0.848 | 0.974 |
| 0.603999999999989 | 0.604 | 0.664 | 0.998 | 0.848 | 0.974 |
| 0.604499999999989 | 0.605 | 0.664 | 0.998 | 0.848 | 0.974 |
| 0.604999999999989 | 0.605 | 0.665 | 0.998 | 0.848 | 0.974 |
| 0.605499999999989 | 0.606 | 0.665 | 0.998 | 0.849 | 0.974 |
| 0.605999999999989 | 0.606 | 0.666 | 0.998 | 0.849 | 0.975 |
| 0.606499999999989 | 0.607 | 0.666 | 0.998 | 0.849 | 0.975 |
| 0.606999999999988 | 0.607 | 0.667 | 0.998 | 0.849 | 0.975 |
| 0.607499999999988 | 0.608 | 0.667 | 0.998 | 0.849 | 0.975 |
| 0.607999999999988 | 0.608 | 0.667 | 0.998 | 0.85 | 0.975 |
| 0.608499999999988 | 0.609 | 0.668 | 0.998 | 0.85 | 0.975 |
| 0.608999999999988 | 0.609 | 0.668 | 0.998 | 0.85 | 0.975 |
| 0.609499999999988 | 0.61 | 0.669 | 0.998 | 0.85 | 0.975 |
| 0.609999999999988 | 0.61 | 0.669 | 0.998 | 0.851 | 0.975 |
| 0.610499999999988 | 0.611 | 0.67 | 0.998 | 0.851 | 0.975 |
| 0.610999999999988 | 0.611 | 0.67 | 0.998 | 0.851 | 0.975 |
| 0.611499999999988 | 0.612 | 0.67 | 0.998 | 0.851 | 0.975 |
| 0.611999999999988 | 0.612 | 0.671 | 0.998 | 0.851 | 0.975 |
| 0.612499999999988 | 0.613 | 0.671 | 0.998 | 0.852 | 0.975 |
| 0.612999999999988 | 0.613 | 0.672 | 0.998 | 0.852 | 0.975 |
| 0.613499999999988 | 0.614 | 0.672 | 0.998 | 0.852 | 0.975 |
| 0.613999999999988 | 0.614 | 0.673 | 0.998 | 0.852 | 0.975 |
| 0.614499999999988 | 0.615 | 0.673 | 0.998 | 0.853 | 0.975 |
| 0.614999999999988 | 0.615 | 0.674 | 0.998 | 0.853 | 0.975 |
| 0.615499999999988 | 0.616 | 0.674 | 0.998 | 0.853 | 0.975 |
| 0.615999999999987 | 0.616 | 0.674 | 0.998 | 0.853 | 0.975 |
| 0.616499999999987 | 0.617 | 0.675 | 0.998 | 0.853 | 0.975 |
| 0.616999999999987 | 0.617 | 0.675 | 0.998 | 0.854 | 0.975 |
| 0.617499999999987 | 0.618 | 0.676 | 0.998 | 0.854 | 0.975 |
| 0.617999999999987 | 0.618 | 0.676 | 0.998 | 0.854 | 0.975 |
| 0.618499999999987 | 0.619 | 0.677 | 0.998 | 0.854 | 0.975 |
| 0.618999999999987 | 0.619 | 0.677 | 0.998 | 0.855 | 0.976 |
| 0.619499999999987 | 0.62 | 0.678 | 0.998 | 0.855 | 0.976 |
| 0.619999999999987 | 0.62 | 0.678 | 0.998 | 0.855 | 0.976 |
| 0.620499999999987 | 0.621 | 0.678 | 0.998 | 0.855 | 0.976 |
| 0.620999999999987 | 0.621 | 0.679 | 0.998 | 0.855 | 0.976 |
| 0.621499999999987 | 0.622 | 0.679 | 0.998 | 0.856 | 0.976 |
| 0.621999999999987 | 0.622 | 0.68 | 0.998 | 0.856 | 0.976 |
| 0.622499999999987 | 0.623 | 0.68 | 0.998 | 0.856 | 0.976 |
| 0.622999999999987 | 0.623 | 0.681 | 0.998 | 0.856 | 0.976 |
| 0.623499999999987 | 0.624 | 0.681 | 0.998 | 0.856 | 0.976 |
| 0.623999999999987 | 0.624 | 0.681 | 0.998 | 0.857 | 0.976 |
| 0.624499999999987 | 0.625 | 0.682 | 0.998 | 0.857 | 0.976 |
| 0.624999999999986 | 0.625 | 0.682 | 0.998 | 0.857 | 0.976 |
| 0.625499999999986 | 0.626 | 0.683 | 0.998 | 0.857 | 0.976 |
| 0.625999999999986 | 0.626 | 0.683 | 0.998 | 0.858 | 0.976 |
| 0.626499999999986 | 0.627 | 0.684 | 0.998 | 0.858 | 0.976 |
| 0.626999999999986 | 0.627 | 0.684 | 0.998 | 0.858 | 0.976 |
| 0.627499999999986 | 0.628 | 0.685 | 0.998 | 0.858 | 0.976 |
| 0.627999999999986 | 0.628 | 0.685 | 0.998 | 0.858 | 0.976 |
| 0.628499999999986 | 0.629 | 0.685 | 0.998 | 0.859 | 0.976 |
| 0.628999999999986 | 0.629 | 0.686 | 0.998 | 0.859 | 0.976 |
| 0.629499999999986 | 0.63 | 0.686 | 0.998 | 0.859 | 0.976 |
| 0.629999999999986 | 0.63 | 0.687 | 0.998 | 0.859 | 0.976 |
| 0.630499999999986 | 0.631 | 0.687 | 0.998 | 0.86 | 0.976 |
| 0.630999999999986 | 0.631 | 0.688 | 0.998 | 0.86 | 0.976 |
| 0.631499999999986 | 0.632 | 0.688 | 0.998 | 0.86 | 0.977 |
| 0.631999999999986 | 0.632 | 0.688 | 0.998 | 0.86 | 0.977 |
| 0.632499999999986 | 0.633 | 0.689 | 0.998 | 0.86 | 0.977 |
| 0.632999999999986 | 0.633 | 0.689 | 0.998 | 0.861 | 0.977 |
| 0.633499999999986 | 0.634 | 0.69 | 0.998 | 0.861 | 0.977 |
| 0.633999999999985 | 0.634 | 0.69 | 0.998 | 0.861 | 0.977 |
| 0.634499999999985 | 0.635 | 0.691 | 0.998 | 0.861 | 0.977 |
| 0.634999999999985 | 0.635 | 0.691 | 0.998 | 0.861 | 0.977 |
| 0.635499999999985 | 0.636 | 0.692 | 0.998 | 0.862 | 0.977 |
| 0.635999999999985 | 0.636 | 0.692 | 0.998 | 0.862 | 0.977 |
| 0.636499999999985 | 0.637 | 0.692 | 0.998 | 0.862 | 0.977 |
| 0.636999999999985 | 0.637 | 0.693 | 0.998 | 0.862 | 0.977 |
| 0.637499999999985 | 0.638 | 0.693 | 0.998 | 0.863 | 0.977 |
| 0.637999999999985 | 0.638 | 0.694 | 0.998 | 0.863 | 0.977 |
| 0.638499999999985 | 0.639 | 0.694 | 0.998 | 0.863 | 0.977 |
| 0.638999999999985 | 0.639 | 0.695 | 0.998 | 0.863 | 0.977 |
| 0.639499999999985 | 0.64 | 0.695 | 0.998 | 0.863 | 0.977 |
| 0.639999999999985 | 0.64 | 0.695 | 0.998 | 0.864 | 0.977 |
| 0.640499999999985 | 0.641 | 0.696 | 0.998 | 0.864 | 0.977 |
| 0.640999999999985 | 0.641 | 0.696 | 0.998 | 0.864 | 0.977 |
| 0.641499999999985 | 0.642 | 0.697 | 0.998 | 0.864 | 0.977 |
| 0.641999999999985 | 0.642 | 0.697 | 0.998 | 0.864 | 0.977 |
| 0.642499999999985 | 0.643 | 0.698 | 0.998 | 0.865 | 0.977 |
| 0.642999999999984 | 0.643 | 0.698 | 0.998 | 0.865 | 0.977 |
| 0.643499999999984 | 0.644 | 0.699 | 0.998 | 0.865 | 0.977 |
| 0.643999999999984 | 0.644 | 0.699 | 0.998 | 0.865 | 0.977 |
| 0.644499999999984 | 0.645 | 0.699 | 0.998 | 0.866 | 0.978 |
| 0.644999999999984 | 0.645 | 0.7 | 0.998 | 0.866 | 0.978 |
| 0.645499999999984 | 0.646 | 0.7 | 0.998 | 0.866 | 0.978 |
| 0.645999999999984 | 0.646 | 0.701 | 0.998 | 0.866 | 0.978 |
| 0.646499999999984 | 0.647 | 0.701 | 0.998 | 0.866 | 0.978 |
| 0.646999999999984 | 0.647 | 0.702 | 0.998 | 0.867 | 0.978 |
| 0.647499999999984 | 0.648 | 0.702 | 0.998 | 0.867 | 0.978 |
| 0.647999999999984 | 0.648 | 0.702 | 0.998 | 0.867 | 0.978 |
| 0.648499999999984 | 0.649 | 0.703 | 0.998 | 0.867 | 0.978 |
| 0.648999999999984 | 0.649 | 0.703 | 0.998 | 0.867 | 0.978 |
| 0.649499999999984 | 0.65 | 0.704 | 0.998 | 0.868 | 0.978 |
| 0.649999999999984 | 0.65 | 0.704 | 0.998 | 0.868 | 0.978 |
| 0.650499999999984 | 0.651 | 0.705 | 0.998 | 0.868 | 0.978 |
| 0.650999999999984 | 0.651 | 0.705 | 0.998 | 0.868 | 0.978 |
| 0.651499999999984 | 0.652 | 0.706 | 0.998 | 0.869 | 0.978 |
| 0.651999999999983 | 0.652 | 0.706 | 0.998 | 0.869 | 0.978 |
| 0.652499999999983 | 0.653 | 0.706 | 0.998 | 0.869 | 0.978 |
| 0.652999999999983 | 0.653 | 0.707 | 0.998 | 0.869 | 0.978 |
| 0.653499999999983 | 0.654 | 0.707 | 0.998 | 0.869 | 0.978 |
| 0.653999999999983 | 0.654 | 0.708 | 0.998 | 0.87 | 0.978 |
| 0.654499999999983 | 0.655 | 0.708 | 0.998 | 0.87 | 0.978 |
| 0.654999999999983 | 0.655 | 0.709 | 0.998 | 0.87 | 0.978 |
| 0.655499999999983 | 0.656 | 0.709 | 0.998 | 0.87 | 0.978 |
| 0.655999999999983 | 0.656 | 0.709 | 0.998 | 0.87 | 0.978 |
| 0.656499999999983 | 0.657 | 0.71 | 0.998 | 0.871 | 0.978 |
| 0.656999999999983 | 0.657 | 0.71 | 0.998 | 0.871 | 0.978 |
| 0.657499999999983 | 0.658 | 0.711 | 0.998 | 0.871 | 0.978 |
| 0.657999999999983 | 0.658 | 0.711 | 0.998 | 0.871 | 0.979 |
| 0.658499999999983 | 0.659 | 0.712 | 0.998 | 0.872 | 0.979 |
| 0.658999999999983 | 0.659 | 0.712 | 0.998 | 0.872 | 0.979 |
| 0.659499999999983 | 0.66 | 0.713 | 0.998 | 0.872 | 0.979 |
| 0.659999999999983 | 0.66 | 0.713 | 0.998 | 0.872 | 0.979 |
| 0.660499999999983 | 0.661 | 0.713 | 0.998 | 0.872 | 0.979 |
| 0.660999999999983 | 0.661 | 0.714 | 0.998 | 0.873 | 0.979 |
| 0.661499999999982 | 0.662 | 0.714 | 0.998 | 0.873 | 0.979 |
| 0.661999999999982 | 0.662 | 0.715 | 0.998 | 0.873 | 0.979 |
| 0.662499999999982 | 0.663 | 0.715 | 0.998 | 0.873 | 0.979 |
| 0.662999999999982 | 0.663 | 0.716 | 0.998 | 0.873 | 0.979 |
| 0.663499999999982 | 0.664 | 0.716 | 0.998 | 0.874 | 0.979 |
| 0.663999999999982 | 0.664 | 0.716 | 0.998 | 0.874 | 0.979 |
| 0.664499999999982 | 0.665 | 0.717 | 0.998 | 0.874 | 0.979 |
| 0.664999999999982 | 0.665 | 0.717 | 0.998 | 0.874 | 0.979 |
| 0.665499999999982 | 0.666 | 0.718 | 0.998 | 0.875 | 0.979 |
| 0.665999999999982 | 0.666 | 0.718 | 0.998 | 0.875 | 0.979 |
| 0.666499999999982 | 0.667 | 0.719 | 0.998 | 0.875 | 0.979 |
| 0.666999999999982 | 0.667 | 0.719 | 0.998 | 0.875 | 0.979 |
| 0.667499999999982 | 0.668 | 0.719 | 0.998 | 0.875 | 0.979 |
| 0.667999999999982 | 0.668 | 0.72 | 0.998 | 0.876 | 0.979 |
| 0.668499999999982 | 0.669 | 0.72 | 0.998 | 0.876 | 0.979 |
| 0.668999999999982 | 0.669 | 0.721 | 0.998 | 0.876 | 0.979 |
| 0.669499999999982 | 0.67 | 0.721 | 0.998 | 0.876 | 0.979 |
| 0.669999999999982 | 0.67 | 0.722 | 0.998 | 0.876 | 0.979 |
| 0.670499999999981 | 0.671 | 0.722 | 0.998 | 0.877 | 0.979 |
| 0.670999999999981 | 0.671 | 0.723 | 0.998 | 0.877 | 0.979 |
| 0.671499999999981 | 0.672 | 0.723 | 0.998 | 0.877 | 0.98 |
| 0.671999999999981 | 0.672 | 0.723 | 0.998 | 0.877 | 0.98 |
| 0.672499999999981 | 0.673 | 0.724 | 0.998 | 0.877 | 0.98 |
| 0.672999999999981 | 0.673 | 0.724 | 0.998 | 0.878 | 0.98 |
| 0.673499999999981 | 0.674 | 0.725 | 0.998 | 0.878 | 0.98 |
| 0.673999999999981 | 0.674 | 0.725 | 0.998 | 0.878 | 0.98 |
| 0.674499999999981 | 0.675 | 0.726 | 0.998 | 0.878 | 0.98 |
| 0.674999999999981 | 0.675 | 0.726 | 0.998 | 0.879 | 0.98 |
| 0.675499999999981 | 0.676 | 0.726 | 0.998 | 0.879 | 0.98 |
| 0.675999999999981 | 0.676 | 0.727 | 0.998 | 0.879 | 0.98 |
| 0.676499999999981 | 0.677 | 0.727 | 0.998 | 0.879 | 0.98 |
| 0.676999999999981 | 0.677 | 0.728 | 0.998 | 0.879 | 0.98 |
| 0.677499999999981 | 0.678 | 0.728 | 0.998 | 0.88 | 0.98 |
| 0.677999999999981 | 0.678 | 0.729 | 0.998 | 0.88 | 0.98 |
| 0.678499999999981 | 0.679 | 0.729 | 0.998 | 0.88 | 0.98 |
| 0.678999999999981 | 0.679 | 0.729 | 0.998 | 0.88 | 0.98 |
| 0.67949999999998 | 0.68 | 0.73 | 0.998 | 0.88 | 0.98 |
| 0.67999999999998 | 0.68 | 0.73 | 0.998 | 0.881 | 0.98 |
| 0.68049999999998 | 0.681 | 0.731 | 0.998 | 0.881 | 0.98 |
| 0.68099999999998 | 0.681 | 0.731 | 0.998 | 0.881 | 0.98 |
| 0.68149999999998 | 0.682 | 0.732 | 0.998 | 0.881 | 0.98 |
| 0.68199999999998 | 0.682 | 0.732 | 0.998 | 0.881 | 0.98 |
| 0.68249999999998 | 0.683 | 0.733 | 0.998 | 0.882 | 0.98 |
| 0.68299999999998 | 0.683 | 0.733 | 0.998 | 0.882 | 0.98 |
| 0.68349999999998 | 0.684 | 0.733 | 0.998 | 0.882 | 0.98 |
| 0.68399999999998 | 0.684 | 0.734 | 0.998 | 0.882 | 0.98 |
| 0.68449999999998 | 0.685 | 0.734 | 0.998 | 0.882 | 0.98 |
| 0.68499999999998 | 0.685 | 0.735 | 0.998 | 0.883 | 0.981 |
| 0.68549999999998 | 0.686 | 0.735 | 0.998 | 0.883 | 0.981 |
| 0.68599999999998 | 0.686 | 0.736 | 0.998 | 0.883 | 0.981 |
| 0.68649999999998 | 0.687 | 0.736 | 0.998 | 0.883 | 0.981 |
| 0.68699999999998 | 0.687 | 0.736 | 0.998 | 0.884 | 0.981 |
| 0.68749999999998 | 0.688 | 0.737 | 0.998 | 0.884 | 0.981 |
| 0.68799999999998 | 0.688 | 0.737 | 0.998 | 0.884 | 0.981 |
| 0.688499999999979 | 0.689 | 0.738 | 0.998 | 0.884 | 0.981 |
| 0.688999999999979 | 0.689 | 0.738 | 0.998 | 0.884 | 0.981 |
| 0.689499999999979 | 0.69 | 0.739 | 0.998 | 0.885 | 0.981 |
| 0.689999999999979 | 0.69 | 0.739 | 0.998 | 0.885 | 0.981 |
| 0.690499999999979 | 0.691 | 0.739 | 0.998 | 0.885 | 0.981 |
| 0.690999999999979 | 0.691 | 0.74 | 0.998 | 0.885 | 0.981 |
| 0.691499999999979 | 0.692 | 0.74 | 0.998 | 0.885 | 0.981 |
| 0.691999999999979 | 0.692 | 0.741 | 0.998 | 0.886 | 0.981 |
| 0.692499999999979 | 0.693 | 0.741 | 0.998 | 0.886 | 0.981 |
| 0.692999999999979 | 0.693 | 0.742 | 0.998 | 0.886 | 0.981 |
| 0.693499999999979 | 0.694 | 0.742 | 0.998 | 0.886 | 0.981 |
| 0.693999999999979 | 0.694 | 0.742 | 0.998 | 0.886 | 0.981 |
| 0.694499999999979 | 0.695 | 0.743 | 0.998 | 0.887 | 0.981 |
| 0.694999999999979 | 0.695 | 0.743 | 0.998 | 0.887 | 0.981 |
| 0.695499999999979 | 0.696 | 0.744 | 0.998 | 0.887 | 0.981 |
| 0.695999999999979 | 0.696 | 0.744 | 0.998 | 0.887 | 0.981 |
| 0.696499999999979 | 0.697 | 0.745 | 0.998 | 0.887 | 0.981 |
| 0.696999999999979 | 0.697 | 0.745 | 0.998 | 0.888 | 0.981 |
| 0.697499999999978 | 0.698 | 0.746 | 0.998 | 0.888 | 0.981 |
| 0.697999999999978 | 0.698 | 0.746 | 0.998 | 0.888 | 0.981 |
| 0.698499999999978 | 0.699 | 0.746 | 0.998 | 0.888 | 0.981 |
| 0.698999999999978 | 0.699 | 0.747 | 0.998 | 0.888 | 0.982 |
| 0.699499999999978 | 0.7 | 0.747 | 0.998 | 0.889 | 0.982 |
| 0.699999999999978 | 0.7 | 0.748 | 0.998 | 0.889 | 0.982 |
| 0.700499999999978 | 0.701 | 0.748 | 0.998 | 0.889 | 0.982 |
| 0.700999999999978 | 0.701 | 0.749 | 0.998 | 0.889 | 0.982 |
| 0.701499999999978 | 0.702 | 0.749 | 0.998 | 0.89 | 0.982 |
| 0.701999999999978 | 0.702 | 0.749 | 0.998 | 0.89 | 0.982 |
| 0.702499999999978 | 0.703 | 0.75 | 0.998 | 0.89 | 0.982 |
| 0.702999999999978 | 0.703 | 0.75 | 0.998 | 0.89 | 0.982 |
| 0.703499999999978 | 0.704 | 0.751 | 0.998 | 0.89 | 0.982 |
| 0.703999999999978 | 0.704 | 0.751 | 0.998 | 0.891 | 0.982 |
| 0.704499999999978 | 0.705 | 0.752 | 0.998 | 0.891 | 0.982 |
| 0.704999999999978 | 0.705 | 0.752 | 0.998 | 0.891 | 0.982 |
| 0.705499999999978 | 0.706 | 0.752 | 0.998 | 0.891 | 0.982 |
| 0.705999999999978 | 0.706 | 0.753 | 0.998 | 0.891 | 0.982 |
| 0.706499999999978 | 0.707 | 0.753 | 0.998 | 0.892 | 0.982 |
| 0.706999999999977 | 0.707 | 0.754 | 0.998 | 0.892 | 0.982 |
| 0.707499999999977 | 0.708 | 0.754 | 0.998 | 0.892 | 0.982 |
| 0.707999999999977 | 0.708 | 0.755 | 0.998 | 0.892 | 0.982 |
| 0.708499999999977 | 0.709 | 0.755 | 0.998 | 0.892 | 0.982 |
| 0.708999999999977 | 0.709 | 0.755 | 0.998 | 0.893 | 0.982 |
| 0.709499999999977 | 0.71 | 0.756 | 0.998 | 0.893 | 0.982 |
| 0.709999999999977 | 0.71 | 0.756 | 0.998 | 0.893 | 0.982 |
| 0.710499999999977 | 0.711 | 0.757 | 0.998 | 0.893 | 0.982 |
| 0.710999999999977 | 0.711 | 0.757 | 0.998 | 0.893 | 0.982 |
| 0.711499999999977 | 0.712 | 0.758 | 0.998 | 0.894 | 0.982 |
| 0.711999999999977 | 0.712 | 0.758 | 0.998 | 0.894 | 0.982 |
| 0.712499999999977 | 0.713 | 0.758 | 0.998 | 0.894 | 0.982 |
| 0.712999999999977 | 0.713 | 0.759 | 0.998 | 0.894 | 0.983 |
| 0.713499999999977 | 0.714 | 0.759 | 0.998 | 0.894 | 0.983 |
| 0.713999999999977 | 0.714 | 0.76 | 0.998 | 0.895 | 0.983 |
| 0.714499999999977 | 0.715 | 0.76 | 0.998 | 0.895 | 0.983 |
| 0.714999999999977 | 0.715 | 0.761 | 0.998 | 0.895 | 0.983 |
| 0.715499999999977 | 0.716 | 0.761 | 0.998 | 0.895 | 0.983 |
| 0.715999999999976 | 0.716 | 0.761 | 0.998 | 0.895 | 0.983 |
| 0.716499999999976 | 0.717 | 0.762 | 0.998 | 0.896 | 0.983 |
| 0.716999999999976 | 0.717 | 0.762 | 0.998 | 0.896 | 0.983 |
| 0.717499999999976 | 0.718 | 0.763 | 0.998 | 0.896 | 0.983 |
| 0.717999999999976 | 0.718 | 0.763 | 0.998 | 0.896 | 0.983 |
| 0.718499999999976 | 0.719 | 0.764 | 0.998 | 0.896 | 0.983 |
| 0.718999999999976 | 0.719 | 0.764 | 0.998 | 0.897 | 0.983 |
| 0.719499999999976 | 0.72 | 0.764 | 0.998 | 0.897 | 0.983 |
| 0.719999999999976 | 0.72 | 0.765 | 0.998 | 0.897 | 0.983 |
| 0.720499999999976 | 0.721 | 0.765 | 0.998 | 0.897 | 0.983 |
| 0.720999999999976 | 0.721 | 0.766 | 0.998 | 0.897 | 0.983 |
| 0.721499999999976 | 0.722 | 0.766 | 0.998 | 0.898 | 0.983 |
| 0.721999999999976 | 0.722 | 0.767 | 0.998 | 0.898 | 0.983 |
| 0.722499999999976 | 0.723 | 0.767 | 0.998 | 0.898 | 0.983 |
| 0.722999999999976 | 0.723 | 0.768 | 0.998 | 0.898 | 0.983 |
| 0.723499999999976 | 0.724 | 0.768 | 0.998 | 0.898 | 0.983 |
| 0.723999999999976 | 0.724 | 0.768 | 0.998 | 0.899 | 0.983 |
| 0.724499999999976 | 0.725 | 0.769 | 0.998 | 0.899 | 0.983 |
| 0.724999999999975 | 0.725 | 0.769 | 0.998 | 0.899 | 0.983 |
| 0.725499999999975 | 0.726 | 0.77 | 0.998 | 0.899 | 0.983 |
| 0.725999999999975 | 0.726 | 0.77 | 0.998 | 0.899 | 0.983 |
| 0.726499999999975 | 0.727 | 0.771 | 0.998 | 0.9 | 0.983 |
| 0.726999999999975 | 0.727 | 0.771 | 0.998 | 0.9 | 0.983 |
| 0.727499999999975 | 0.728 | 0.771 | 0.998 | 0.9 | 0.984 |
| 0.727999999999975 | 0.728 | 0.772 | 0.998 | 0.9 | 0.984 |
| 0.728499999999975 | 0.729 | 0.772 | 0.998 | 0.9 | 0.984 |
| 0.728999999999975 | 0.729 | 0.773 | 0.998 | 0.901 | 0.984 |
| 0.729499999999975 | 0.73 | 0.773 | 0.998 | 0.901 | 0.984 |
| 0.729999999999975 | 0.73 | 0.774 | 0.998 | 0.901 | 0.984 |
| 0.730499999999975 | 0.731 | 0.774 | 0.998 | 0.901 | 0.984 |
| 0.730999999999975 | 0.731 | 0.774 | 0.998 | 0.902 | 0.984 |
| 0.731499999999975 | 0.732 | 0.775 | 0.998 | 0.902 | 0.984 |
| 0.731999999999975 | 0.732 | 0.775 | 0.998 | 0.902 | 0.984 |
| 0.732499999999975 | 0.733 | 0.776 | 0.998 | 0.902 | 0.984 |
| 0.732999999999975 | 0.733 | 0.776 | 0.998 | 0.902 | 0.984 |
| 0.733499999999975 | 0.734 | 0.777 | 0.998 | 0.903 | 0.984 |
| 0.733999999999974 | 0.734 | 0.777 | 0.998 | 0.903 | 0.984 |
| 0.734499999999974 | 0.735 | 0.777 | 0.998 | 0.903 | 0.984 |
| 0.734999999999974 | 0.735 | 0.778 | 0.998 | 0.903 | 0.984 |
| 0.735499999999974 | 0.736 | 0.778 | 0.998 | 0.903 | 0.984 |
| 0.735999999999974 | 0.736 | 0.779 | 0.998 | 0.904 | 0.984 |
| 0.736499999999974 | 0.737 | 0.779 | 0.998 | 0.904 | 0.984 |
| 0.736999999999974 | 0.737 | 0.78 | 0.998 | 0.904 | 0.984 |
| 0.737499999999974 | 0.738 | 0.78 | 0.998 | 0.904 | 0.984 |
| 0.737999999999974 | 0.738 | 0.78 | 0.998 | 0.904 | 0.984 |
| 0.738499999999974 | 0.739 | 0.781 | 0.998 | 0.905 | 0.984 |
| 0.738999999999974 | 0.739 | 0.781 | 0.998 | 0.905 | 0.984 |
| 0.739499999999974 | 0.74 | 0.782 | 0.998 | 0.905 | 0.984 |
| 0.739999999999974 | 0.74 | 0.782 | 0.998 | 0.905 | 0.984 |
| 0.740499999999974 | 0.741 | 0.783 | 0.999 | 0.905 | 0.984 |
| 0.740999999999974 | 0.741 | 0.783 | 0.999 | 0.906 | 0.984 |
| 0.741499999999974 | 0.742 | 0.783 | 0.999 | 0.906 | 0.984 |
| 0.741999999999974 | 0.742 | 0.784 | 0.999 | 0.906 | 0.985 |
| 0.742499999999974 | 0.743 | 0.784 | 0.999 | 0.906 | 0.985 |
| 0.742999999999973 | 0.743 | 0.785 | 0.999 | 0.906 | 0.985 |
| 0.743499999999973 | 0.744 | 0.785 | 0.999 | 0.907 | 0.985 |
| 0.743999999999973 | 0.744 | 0.786 | 0.999 | 0.907 | 0.985 |
| 0.744499999999973 | 0.745 | 0.786 | 0.999 | 0.907 | 0.985 |
| 0.744999999999973 | 0.745 | 0.786 | 0.999 | 0.907 | 0.985 |
| 0.745499999999973 | 0.746 | 0.787 | 0.999 | 0.907 | 0.985 |
| 0.745999999999973 | 0.746 | 0.787 | 0.999 | 0.908 | 0.985 |
| 0.746499999999973 | 0.747 | 0.788 | 0.999 | 0.908 | 0.985 |
| 0.746999999999973 | 0.747 | 0.788 | 0.999 | 0.908 | 0.985 |
| 0.747499999999973 | 0.748 | 0.789 | 0.999 | 0.908 | 0.985 |
| 0.747999999999973 | 0.748 | 0.789 | 0.999 | 0.908 | 0.985 |
| 0.748499999999973 | 0.749 | 0.789 | 0.999 | 0.908 | 0.985 |
| 0.748999999999973 | 0.749 | 0.79 | 0.999 | 0.909 | 0.985 |
| 0.749499999999973 | 0.75 | 0.79 | 0.999 | 0.909 | 0.985 |
| 0.749999999999973 | 0.75 | 0.791 | 0.999 | 0.909 | 0.985 |
| 0.750499999999973 | 0.751 | 0.791 | 0.999 | 0.909 | 0.985 |
| 0.750999999999973 | 0.751 | 0.792 | 0.999 | 0.909 | 0.985 |
| 0.751499999999973 | 0.752 | 0.792 | 0.999 | 0.91 | 0.985 |
| 0.751999999999973 | 0.752 | 0.792 | 0.999 | 0.91 | 0.985 |
| 0.752499999999972 | 0.753 | 0.793 | 0.999 | 0.91 | 0.985 |
| 0.752999999999972 | 0.753 | 0.793 | 0.999 | 0.91 | 0.985 |
| 0.753499999999972 | 0.754 | 0.794 | 0.999 | 0.91 | 0.985 |
| 0.753999999999972 | 0.754 | 0.794 | 0.999 | 0.911 | 0.985 |
| 0.754499999999972 | 0.755 | 0.795 | 0.999 | 0.911 | 0.985 |
| 0.754999999999972 | 0.755 | 0.795 | 0.999 | 0.911 | 0.985 |
| 0.755499999999972 | 0.756 | 0.795 | 0.999 | 0.911 | 0.985 |
| 0.755999999999972 | 0.756 | 0.796 | 0.999 | 0.911 | 0.985 |
| 0.756499999999972 | 0.757 | 0.796 | 0.999 | 0.912 | 0.986 |
| 0.756999999999972 | 0.757 | 0.797 | 0.999 | 0.912 | 0.986 |
| 0.757499999999972 | 0.758 | 0.797 | 0.999 | 0.912 | 0.986 |
| 0.757999999999972 | 0.758 | 0.798 | 0.999 | 0.912 | 0.986 |
| 0.758499999999972 | 0.759 | 0.798 | 0.999 | 0.912 | 0.986 |
| 0.758999999999972 | 0.759 | 0.798 | 0.999 | 0.913 | 0.986 |
| 0.759499999999972 | 0.76 | 0.799 | 0.999 | 0.913 | 0.986 |
| 0.759999999999972 | 0.76 | 0.799 | 0.999 | 0.913 | 0.986 |
| 0.760499999999972 | 0.761 | 0.8 | 0.999 | 0.913 | 0.986 |
| 0.760999999999972 | 0.761 | 0.8 | 0.999 | 0.913 | 0.986 |
| 0.761499999999971 | 0.762 | 0.801 | 0.999 | 0.914 | 0.986 |
| 0.761999999999971 | 0.762 | 0.801 | 0.999 | 0.914 | 0.986 |
| 0.762499999999971 | 0.763 | 0.801 | 0.999 | 0.914 | 0.986 |
| 0.762999999999971 | 0.763 | 0.802 | 0.999 | 0.914 | 0.986 |
| 0.763499999999971 | 0.764 | 0.802 | 0.999 | 0.914 | 0.986 |
| 0.763999999999971 | 0.764 | 0.803 | 0.999 | 0.915 | 0.986 |
| 0.764499999999971 | 0.765 | 0.803 | 0.999 | 0.915 | 0.986 |
| 0.764999999999971 | 0.765 | 0.804 | 0.999 | 0.915 | 0.986 |
| 0.765499999999971 | 0.766 | 0.804 | 0.999 | 0.915 | 0.986 |
| 0.765999999999971 | 0.766 | 0.804 | 0.999 | 0.915 | 0.986 |
| 0.766499999999971 | 0.767 | 0.805 | 0.999 | 0.916 | 0.986 |
| 0.766999999999971 | 0.767 | 0.805 | 0.999 | 0.916 | 0.986 |
| 0.767499999999971 | 0.768 | 0.806 | 0.999 | 0.916 | 0.986 |
| 0.767999999999971 | 0.768 | 0.806 | 0.999 | 0.916 | 0.986 |
| 0.768499999999971 | 0.769 | 0.807 | 0.999 | 0.916 | 0.986 |
| 0.768999999999971 | 0.769 | 0.807 | 0.999 | 0.917 | 0.986 |
| 0.769499999999971 | 0.77 | 0.807 | 0.999 | 0.917 | 0.986 |
| 0.769999999999971 | 0.77 | 0.808 | 0.999 | 0.917 | 0.986 |
| 0.77049999999997 | 0.771 | 0.808 | 0.999 | 0.917 | 0.986 |
| 0.77099999999997 | 0.771 | 0.809 | 0.999 | 0.917 | 0.986 |
| 0.77149999999997 | 0.772 | 0.809 | 0.999 | 0.918 | 0.987 |
| 0.77199999999997 | 0.772 | 0.81 | 0.999 | 0.918 | 0.987 |
| 0.77249999999997 | 0.773 | 0.81 | 0.999 | 0.918 | 0.987 |
| 0.77299999999997 | 0.773 | 0.81 | 0.999 | 0.918 | 0.987 |
| 0.77349999999997 | 0.774 | 0.811 | 0.999 | 0.918 | 0.987 |
| 0.77399999999997 | 0.774 | 0.811 | 0.999 | 0.919 | 0.987 |
| 0.77449999999997 | 0.775 | 0.812 | 0.999 | 0.919 | 0.987 |
| 0.77499999999997 | 0.775 | 0.812 | 0.999 | 0.919 | 0.987 |
| 0.77549999999997 | 0.776 | 0.812 | 0.999 | 0.919 | 0.987 |
| 0.77599999999997 | 0.776 | 0.813 | 0.999 | 0.919 | 0.987 |
| 0.77649999999997 | 0.777 | 0.813 | 0.999 | 0.92 | 0.987 |
| 0.77699999999997 | 0.777 | 0.814 | 0.999 | 0.92 | 0.987 |
| 0.77749999999997 | 0.778 | 0.814 | 0.999 | 0.92 | 0.987 |
| 0.77799999999997 | 0.778 | 0.815 | 0.999 | 0.92 | 0.987 |
| 0.77849999999997 | 0.779 | 0.815 | 0.999 | 0.92 | 0.987 |
| 0.77899999999997 | 0.779 | 0.815 | 0.999 | 0.92 | 0.987 |
| 0.779499999999969 | 0.78 | 0.816 | 0.999 | 0.921 | 0.987 |
| 0.779999999999969 | 0.78 | 0.816 | 0.999 | 0.921 | 0.987 |
| 0.780499999999969 | 0.781 | 0.817 | 0.999 | 0.921 | 0.987 |
| 0.780999999999969 | 0.781 | 0.817 | 0.999 | 0.921 | 0.987 |
| 0.781499999999969 | 0.782 | 0.818 | 0.999 | 0.921 | 0.987 |
| 0.781999999999969 | 0.782 | 0.818 | 0.999 | 0.922 | 0.987 |
| 0.782499999999969 | 0.783 | 0.818 | 0.999 | 0.922 | 0.987 |
| 0.782999999999969 | 0.783 | 0.819 | 0.999 | 0.922 | 0.987 |
| 0.783499999999969 | 0.784 | 0.819 | 0.999 | 0.922 | 0.987 |
| 0.783999999999969 | 0.784 | 0.82 | 0.999 | 0.922 | 0.987 |
| 0.784499999999969 | 0.785 | 0.82 | 0.999 | 0.923 | 0.987 |
| 0.784999999999969 | 0.785 | 0.821 | 0.999 | 0.923 | 0.987 |
| 0.785499999999969 | 0.786 | 0.821 | 0.999 | 0.923 | 0.987 |
| 0.785999999999969 | 0.786 | 0.821 | 0.999 | 0.923 | 0.987 |
| 0.786499999999969 | 0.787 | 0.822 | 0.999 | 0.923 | 0.987 |
| 0.786999999999969 | 0.787 | 0.822 | 0.999 | 0.924 | 0.988 |
| 0.787499999999969 | 0.788 | 0.823 | 0.999 | 0.924 | 0.988 |
| 0.787999999999969 | 0.788 | 0.823 | 0.999 | 0.924 | 0.988 |
| 0.788499999999968 | 0.789 | 0.824 | 0.999 | 0.924 | 0.988 |
| 0.788999999999968 | 0.789 | 0.824 | 0.999 | 0.924 | 0.988 |
| 0.789499999999968 | 0.79 | 0.824 | 0.999 | 0.925 | 0.988 |
| 0.789999999999968 | 0.79 | 0.825 | 0.999 | 0.925 | 0.988 |
| 0.790499999999968 | 0.791 | 0.825 | 0.999 | 0.925 | 0.988 |
| 0.790999999999968 | 0.791 | 0.826 | 0.999 | 0.925 | 0.988 |
| 0.791499999999968 | 0.792 | 0.826 | 0.999 | 0.925 | 0.988 |
| 0.791999999999968 | 0.792 | 0.827 | 0.999 | 0.926 | 0.988 |
| 0.792499999999968 | 0.793 | 0.827 | 0.999 | 0.926 | 0.988 |
| 0.792999999999968 | 0.793 | 0.827 | 0.999 | 0.926 | 0.988 |
| 0.793499999999968 | 0.794 | 0.828 | 0.999 | 0.926 | 0.988 |
| 0.793999999999968 | 0.794 | 0.828 | 0.999 | 0.926 | 0.988 |
| 0.794499999999968 | 0.795 | 0.829 | 0.999 | 0.926 | 0.988 |
| 0.794999999999968 | 0.795 | 0.829 | 0.999 | 0.927 | 0.988 |
| 0.795499999999968 | 0.796 | 0.83 | 0.999 | 0.927 | 0.988 |
| 0.795999999999968 | 0.796 | 0.83 | 0.999 | 0.927 | 0.988 |
| 0.796499999999968 | 0.797 | 0.83 | 0.999 | 0.927 | 0.988 |
| 0.796999999999968 | 0.797 | 0.831 | 0.999 | 0.927 | 0.988 |
| 0.797499999999967 | 0.798 | 0.831 | 0.999 | 0.928 | 0.988 |
| 0.797999999999967 | 0.798 | 0.832 | 0.999 | 0.928 | 0.988 |
| 0.798499999999967 | 0.799 | 0.832 | 0.999 | 0.928 | 0.988 |
| 0.798999999999967 | 0.799 | 0.832 | 0.999 | 0.928 | 0.988 |
| 0.799499999999967 | 0.8 | 0.833 | 0.999 | 0.928 | 0.988 |
| 0.799999999999967 | 0.8 | 0.833 | 0.999 | 0.929 | 0.988 |
| 0.800499999999967 | 0.801 | 0.834 | 0.999 | 0.929 | 0.988 |
| 0.800999999999967 | 0.801 | 0.834 | 0.999 | 0.929 | 0.988 |
| 0.801499999999967 | 0.802 | 0.835 | 0.999 | 0.929 | 0.988 |
| 0.801999999999967 | 0.802 | 0.835 | 0.999 | 0.929 | 0.989 |
| 0.802499999999967 | 0.803 | 0.835 | 0.999 | 0.93 | 0.989 |
| 0.802999999999967 | 0.803 | 0.836 | 0.999 | 0.93 | 0.989 |
| 0.803499999999967 | 0.804 | 0.836 | 0.999 | 0.93 | 0.989 |
| 0.803999999999967 | 0.804 | 0.837 | 0.999 | 0.93 | 0.989 |
| 0.804499999999967 | 0.805 | 0.837 | 0.999 | 0.93 | 0.989 |
| 0.804999999999967 | 0.805 | 0.838 | 0.999 | 0.93 | 0.989 |
| 0.805499999999967 | 0.806 | 0.838 | 0.999 | 0.931 | 0.989 |
| 0.805999999999967 | 0.806 | 0.838 | 0.999 | 0.931 | 0.989 |
| 0.806499999999967 | 0.807 | 0.839 | 0.999 | 0.931 | 0.989 |
| 0.806999999999966 | 0.807 | 0.839 | 0.999 | 0.931 | 0.989 |
| 0.807499999999966 | 0.808 | 0.84 | 0.999 | 0.931 | 0.989 |
| 0.807999999999966 | 0.808 | 0.84 | 0.999 | 0.932 | 0.989 |
| 0.808499999999966 | 0.809 | 0.841 | 0.999 | 0.932 | 0.989 |
| 0.808999999999966 | 0.809 | 0.841 | 0.999 | 0.932 | 0.989 |
| 0.809499999999966 | 0.81 | 0.841 | 0.999 | 0.932 | 0.989 |
| 0.809999999999966 | 0.81 | 0.842 | 0.999 | 0.932 | 0.989 |
| 0.810499999999966 | 0.811 | 0.842 | 0.999 | 0.933 | 0.989 |
| 0.810999999999966 | 0.811 | 0.843 | 0.999 | 0.933 | 0.989 |
| 0.811499999999966 | 0.812 | 0.843 | 0.999 | 0.933 | 0.989 |
| 0.811999999999966 | 0.812 | 0.844 | 0.999 | 0.933 | 0.989 |
| 0.812499999999966 | 0.813 | 0.844 | 0.999 | 0.933 | 0.989 |
| 0.812999999999966 | 0.813 | 0.844 | 0.999 | 0.934 | 0.989 |
| 0.813499999999966 | 0.814 | 0.845 | 0.999 | 0.934 | 0.989 |
| 0.813999999999966 | 0.814 | 0.845 | 0.999 | 0.934 | 0.989 |
| 0.814499999999966 | 0.815 | 0.846 | 0.999 | 0.934 | 0.989 |
| 0.814999999999966 | 0.815 | 0.846 | 0.999 | 0.934 | 0.989 |
| 0.815499999999966 | 0.816 | 0.846 | 0.999 | 0.934 | 0.989 |
| 0.815999999999965 | 0.816 | 0.847 | 0.999 | 0.935 | 0.989 |
| 0.816499999999965 | 0.817 | 0.847 | 0.999 | 0.935 | 0.989 |
| 0.816999999999965 | 0.817 | 0.848 | 0.999 | 0.935 | 0.989 |
| 0.817499999999965 | 0.818 | 0.848 | 0.999 | 0.935 | 0.989 |
| 0.817999999999965 | 0.818 | 0.849 | 0.999 | 0.935 | 0.99 |
| 0.818499999999965 | 0.819 | 0.849 | 0.999 | 0.936 | 0.99 |
| 0.818999999999965 | 0.819 | 0.849 | 0.999 | 0.936 | 0.99 |
| 0.819499999999965 | 0.82 | 0.85 | 0.999 | 0.936 | 0.99 |
| 0.819999999999965 | 0.82 | 0.85 | 0.999 | 0.936 | 0.99 |
| 0.820499999999965 | 0.821 | 0.851 | 0.999 | 0.936 | 0.99 |
| 0.820999999999965 | 0.821 | 0.851 | 0.999 | 0.937 | 0.99 |
| 0.821499999999965 | 0.822 | 0.852 | 0.999 | 0.937 | 0.99 |
| 0.821999999999965 | 0.822 | 0.852 | 0.999 | 0.937 | 0.99 |
| 0.822499999999965 | 0.823 | 0.852 | 0.999 | 0.937 | 0.99 |
| 0.822999999999965 | 0.823 | 0.853 | 0.999 | 0.937 | 0.99 |
| 0.823499999999965 | 0.824 | 0.853 | 0.999 | 0.937 | 0.99 |
| 0.823999999999965 | 0.824 | 0.854 | 0.999 | 0.938 | 0.99 |
| 0.824499999999965 | 0.825 | 0.854 | 0.999 | 0.938 | 0.99 |
| 0.824999999999964 | 0.825 | 0.855 | 0.999 | 0.938 | 0.99 |
| 0.825499999999964 | 0.826 | 0.855 | 0.999 | 0.938 | 0.99 |
| 0.825999999999964 | 0.826 | 0.855 | 0.999 | 0.938 | 0.99 |
| 0.826499999999964 | 0.827 | 0.856 | 0.999 | 0.939 | 0.99 |
| 0.826999999999964 | 0.827 | 0.856 | 0.999 | 0.939 | 0.99 |
| 0.827499999999964 | 0.828 | 0.857 | 0.999 | 0.939 | 0.99 |
| 0.827999999999964 | 0.828 | 0.857 | 0.999 | 0.939 | 0.99 |
| 0.828499999999964 | 0.829 | 0.857 | 0.999 | 0.939 | 0.99 |
| 0.828999999999964 | 0.829 | 0.858 | 0.999 | 0.94 | 0.99 |
| 0.829499999999964 | 0.83 | 0.858 | 0.999 | 0.94 | 0.99 |
| 0.829999999999964 | 0.83 | 0.859 | 0.999 | 0.94 | 0.99 |
| 0.830499999999964 | 0.831 | 0.859 | 0.999 | 0.94 | 0.99 |
| 0.830999999999964 | 0.831 | 0.86 | 0.999 | 0.94 | 0.99 |
| 0.831499999999964 | 0.832 | 0.86 | 0.999 | 0.94 | 0.99 |
| 0.831999999999964 | 0.832 | 0.86 | 0.999 | 0.941 | 0.99 |
| 0.832499999999964 | 0.833 | 0.861 | 0.999 | 0.941 | 0.99 |
| 0.832999999999964 | 0.833 | 0.861 | 0.999 | 0.941 | 0.99 |
| 0.833499999999964 | 0.834 | 0.862 | 0.999 | 0.941 | 0.99 |
| 0.833999999999963 | 0.834 | 0.862 | 0.999 | 0.941 | 0.991 |
| 0.834499999999963 | 0.835 | 0.863 | 0.999 | 0.942 | 0.991 |
| 0.834999999999963 | 0.835 | 0.863 | 0.999 | 0.942 | 0.991 |
| 0.835499999999963 | 0.836 | 0.863 | 0.999 | 0.942 | 0.991 |
| 0.835999999999963 | 0.836 | 0.864 | 0.999 | 0.942 | 0.991 |
| 0.836499999999963 | 0.837 | 0.864 | 0.999 | 0.942 | 0.991 |
| 0.836999999999963 | 0.837 | 0.865 | 0.999 | 0.943 | 0.991 |
| 0.837499999999963 | 0.838 | 0.865 | 0.999 | 0.943 | 0.991 |
| 0.837999999999963 | 0.838 | 0.865 | 0.999 | 0.943 | 0.991 |
| 0.838499999999963 | 0.839 | 0.866 | 0.999 | 0.943 | 0.991 |
| 0.838999999999963 | 0.839 | 0.866 | 0.999 | 0.943 | 0.991 |
| 0.839499999999963 | 0.84 | 0.867 | 0.999 | 0.943 | 0.991 |
| 0.839999999999963 | 0.84 | 0.867 | 0.999 | 0.944 | 0.991 |
| 0.840499999999963 | 0.841 | 0.868 | 0.999 | 0.944 | 0.991 |
| 0.840999999999963 | 0.841 | 0.868 | 0.999 | 0.944 | 0.991 |
| 0.841499999999963 | 0.842 | 0.868 | 0.999 | 0.944 | 0.991 |
| 0.841999999999963 | 0.842 | 0.869 | 0.999 | 0.944 | 0.991 |
| 0.842499999999963 | 0.843 | 0.869 | 0.999 | 0.945 | 0.991 |
| 0.842999999999963 | 0.843 | 0.87 | 0.999 | 0.945 | 0.991 |
| 0.843499999999962 | 0.844 | 0.87 | 0.999 | 0.945 | 0.991 |
| 0.843999999999962 | 0.844 | 0.871 | 0.999 | 0.945 | 0.991 |
| 0.844499999999962 | 0.845 | 0.871 | 0.999 | 0.945 | 0.991 |
| 0.844999999999962 | 0.845 | 0.871 | 0.999 | 0.946 | 0.991 |
| 0.845499999999962 | 0.846 | 0.872 | 0.999 | 0.946 | 0.991 |
| 0.845999999999962 | 0.846 | 0.872 | 0.999 | 0.946 | 0.991 |
| 0.846499999999962 | 0.847 | 0.873 | 0.999 | 0.946 | 0.991 |
| 0.846999999999962 | 0.847 | 0.873 | 0.999 | 0.946 | 0.991 |
| 0.847499999999962 | 0.848 | 0.873 | 0.999 | 0.946 | 0.991 |
| 0.847999999999962 | 0.848 | 0.874 | 0.999 | 0.947 | 0.991 |
| 0.848499999999962 | 0.849 | 0.874 | 0.999 | 0.947 | 0.991 |
| 0.848999999999962 | 0.849 | 0.875 | 0.999 | 0.947 | 0.991 |
| 0.849499999999962 | 0.85 | 0.875 | 0.999 | 0.947 | 0.991 |
| 0.849999999999962 | 0.85 | 0.876 | 0.999 | 0.947 | 0.992 |
| 0.850499999999962 | 0.851 | 0.876 | 0.999 | 0.948 | 0.992 |
| 0.850999999999962 | 0.851 | 0.876 | 0.999 | 0.948 | 0.992 |
| 0.851499999999962 | 0.852 | 0.877 | 0.999 | 0.948 | 0.992 |
| 0.851999999999962 | 0.852 | 0.877 | 0.999 | 0.948 | 0.992 |
| 0.852499999999961 | 0.853 | 0.878 | 0.999 | 0.948 | 0.992 |
| 0.852999999999961 | 0.853 | 0.878 | 0.999 | 0.948 | 0.992 |
| 0.853499999999961 | 0.854 | 0.879 | 0.999 | 0.949 | 0.992 |
| 0.853999999999961 | 0.854 | 0.879 | 0.999 | 0.949 | 0.992 |
| 0.854499999999961 | 0.855 | 0.879 | 0.999 | 0.949 | 0.992 |
| 0.854999999999961 | 0.855 | 0.88 | 0.999 | 0.949 | 0.992 |
| 0.855499999999961 | 0.856 | 0.88 | 0.999 | 0.949 | 0.992 |
| 0.855999999999961 | 0.856 | 0.881 | 0.999 | 0.95 | 0.992 |
| 0.856499999999961 | 0.857 | 0.881 | 0.999 | 0.95 | 0.992 |
| 0.856999999999961 | 0.857 | 0.881 | 0.999 | 0.95 | 0.992 |
| 0.857499999999961 | 0.858 | 0.882 | 0.999 | 0.95 | 0.992 |
| 0.857999999999961 | 0.858 | 0.882 | 0.999 | 0.95 | 0.992 |
| 0.858499999999961 | 0.859 | 0.883 | 0.999 | 0.95 | 0.992 |
| 0.858999999999961 | 0.859 | 0.883 | 0.999 | 0.951 | 0.992 |
| 0.859499999999961 | 0.86 | 0.884 | 0.999 | 0.951 | 0.992 |
| 0.859999999999961 | 0.86 | 0.884 | 0.999 | 0.951 | 0.992 |
| 0.860499999999961 | 0.861 | 0.884 | 0.999 | 0.951 | 0.992 |
| 0.860999999999961 | 0.861 | 0.885 | 0.999 | 0.951 | 0.992 |
| 0.86149999999996 | 0.862 | 0.885 | 0.999 | 0.952 | 0.992 |
| 0.86199999999996 | 0.862 | 0.886 | 0.999 | 0.952 | 0.992 |
| 0.86249999999996 | 0.863 | 0.886 | 0.999 | 0.952 | 0.992 |
| 0.86299999999996 | 0.863 | 0.886 | 0.999 | 0.952 | 0.992 |
| 0.86349999999996 | 0.864 | 0.887 | 0.999 | 0.952 | 0.992 |
| 0.86399999999996 | 0.864 | 0.887 | 0.999 | 0.953 | 0.992 |
| 0.86449999999996 | 0.865 | 0.888 | 0.999 | 0.953 | 0.992 |
| 0.86499999999996 | 0.865 | 0.888 | 0.999 | 0.953 | 0.992 |
| 0.86549999999996 | 0.866 | 0.889 | 0.999 | 0.953 | 0.992 |
| 0.86599999999996 | 0.866 | 0.889 | 0.999 | 0.953 | 0.992 |
| 0.86649999999996 | 0.867 | 0.889 | 0.999 | 0.953 | 0.992 |
| 0.86699999999996 | 0.867 | 0.89 | 0.999 | 0.954 | 0.993 |
| 0.86749999999996 | 0.868 | 0.89 | 0.999 | 0.954 | 0.993 |
| 0.86799999999996 | 0.868 | 0.891 | 0.999 | 0.954 | 0.993 |
| 0.86849999999996 | 0.869 | 0.891 | 0.999 | 0.954 | 0.993 |
| 0.86899999999996 | 0.869 | 0.892 | 0.999 | 0.954 | 0.993 |
| 0.86949999999996 | 0.87 | 0.892 | 0.999 | 0.955 | 0.993 |
| 0.86999999999996 | 0.87 | 0.892 | 0.999 | 0.955 | 0.993 |
| 0.870499999999959 | 0.871 | 0.893 | 0.999 | 0.955 | 0.993 |
| 0.870999999999959 | 0.871 | 0.893 | 0.999 | 0.955 | 0.993 |
| 0.871499999999959 | 0.872 | 0.894 | 0.999 | 0.955 | 0.993 |
| 0.871999999999959 | 0.872 | 0.894 | 0.999 | 0.955 | 0.993 |
| 0.872499999999959 | 0.873 | 0.894 | 0.999 | 0.956 | 0.993 |
| 0.872999999999959 | 0.873 | 0.895 | 0.999 | 0.956 | 0.993 |
| 0.873499999999959 | 0.874 | 0.895 | 0.999 | 0.956 | 0.993 |
| 0.873999999999959 | 0.874 | 0.896 | 0.999 | 0.956 | 0.993 |
| 0.874499999999959 | 0.875 | 0.896 | 0.999 | 0.956 | 0.993 |
| 0.874999999999959 | 0.875 | 0.897 | 0.999 | 0.957 | 0.993 |
| 0.875499999999959 | 0.876 | 0.897 | 0.999 | 0.957 | 0.993 |
| 0.875999999999959 | 0.876 | 0.897 | 0.999 | 0.957 | 0.993 |
| 0.876499999999959 | 0.877 | 0.898 | 0.999 | 0.957 | 0.993 |
| 0.876999999999959 | 0.877 | 0.898 | 0.999 | 0.957 | 0.993 |
| 0.877499999999959 | 0.878 | 0.899 | 0.999 | 0.957 | 0.993 |
| 0.877999999999959 | 0.878 | 0.899 | 0.999 | 0.958 | 0.993 |
| 0.878499999999959 | 0.879 | 0.899 | 0.999 | 0.958 | 0.993 |
| 0.878999999999959 | 0.879 | 0.9 | 0.999 | 0.958 | 0.993 |
| 0.879499999999958 | 0.88 | 0.9 | 0.999 | 0.958 | 0.993 |
| 0.879999999999958 | 0.88 | 0.901 | 0.999 | 0.958 | 0.993 |
| 0.880499999999958 | 0.881 | 0.901 | 0.999 | 0.959 | 0.993 |
| 0.880999999999958 | 0.881 | 0.902 | 0.999 | 0.959 | 0.993 |
| 0.881499999999958 | 0.882 | 0.902 | 0.999 | 0.959 | 0.993 |
| 0.881999999999958 | 0.882 | 0.902 | 0.999 | 0.959 | 0.993 |
| 0.882499999999958 | 0.883 | 0.903 | 0.999 | 0.959 | 0.993 |
| 0.882999999999958 | 0.883 | 0.903 | 0.999 | 0.959 | 0.993 |
| 0.883499999999958 | 0.884 | 0.904 | 0.999 | 0.96 | 0.994 |
| 0.883999999999958 | 0.884 | 0.904 | 0.999 | 0.96 | 0.994 |
| 0.884499999999958 | 0.885 | 0.904 | 0.999 | 0.96 | 0.994 |
| 0.884999999999958 | 0.885 | 0.905 | 0.999 | 0.96 | 0.994 |
| 0.885499999999958 | 0.886 | 0.905 | 0.999 | 0.96 | 0.994 |
| 0.885999999999958 | 0.886 | 0.906 | 0.999 | 0.96 | 0.994 |
| 0.886499999999958 | 0.887 | 0.906 | 0.999 | 0.961 | 0.994 |
| 0.886999999999958 | 0.887 | 0.907 | 0.999 | 0.961 | 0.994 |
| 0.887499999999958 | 0.888 | 0.907 | 0.999 | 0.961 | 0.994 |
| 0.887999999999958 | 0.888 | 0.907 | 0.999 | 0.961 | 0.994 |
| 0.888499999999957 | 0.889 | 0.908 | 0.999 | 0.961 | 0.994 |
| 0.888999999999957 | 0.889 | 0.908 | 0.999 | 0.962 | 0.994 |
| 0.889499999999957 | 0.89 | 0.909 | 0.999 | 0.962 | 0.994 |
| 0.889999999999957 | 0.89 | 0.909 | 0.999 | 0.962 | 0.994 |
| 0.890499999999957 | 0.891 | 0.91 | 0.999 | 0.962 | 0.994 |
| 0.890999999999957 | 0.891 | 0.91 | 0.999 | 0.962 | 0.994 |
| 0.891499999999957 | 0.892 | 0.91 | 0.999 | 0.962 | 0.994 |
| 0.891999999999957 | 0.892 | 0.911 | 0.999 | 0.963 | 0.994 |
| 0.892499999999957 | 0.893 | 0.911 | 0.999 | 0.963 | 0.994 |
| 0.892999999999957 | 0.893 | 0.912 | 0.999 | 0.963 | 0.994 |
| 0.893499999999957 | 0.894 | 0.912 | 0.999 | 0.963 | 0.994 |
| 0.893999999999957 | 0.894 | 0.912 | 0.999 | 0.963 | 0.994 |
| 0.894499999999957 | 0.895 | 0.913 | 0.999 | 0.964 | 0.994 |
| 0.894999999999957 | 0.895 | 0.913 | 0.999 | 0.964 | 0.994 |
| 0.895499999999957 | 0.896 | 0.914 | 0.999 | 0.964 | 0.994 |
| 0.895999999999957 | 0.896 | 0.914 | 0.999 | 0.964 | 0.994 |
| 0.896499999999957 | 0.897 | 0.915 | 0.999 | 0.964 | 0.994 |
| 0.896999999999957 | 0.897 | 0.915 | 0.999 | 0.964 | 0.994 |
| 0.897499999999956 | 0.898 | 0.915 | 0.999 | 0.965 | 0.994 |
| 0.897999999999956 | 0.898 | 0.916 | 0.999 | 0.965 | 0.994 |
| 0.898499999999956 | 0.899 | 0.916 | 0.999 | 0.965 | 0.994 |
| 0.898999999999956 | 0.899 | 0.917 | 0.999 | 0.965 | 0.994 |
| 0.899499999999956 | 0.9 | 0.917 | 0.999 | 0.965 | 0.994 |
| 0.899999999999956 | 0.9 | 0.917 | 0.999 | 0.966 | 0.994 |
| 0.900499999999956 | 0.901 | 0.918 | 0.999 | 0.966 | 0.995 |
| 0.900999999999956 | 0.901 | 0.918 | 0.999 | 0.966 | 0.995 |
| 0.901499999999956 | 0.902 | 0.919 | 0.999 | 0.966 | 0.995 |
| 0.901999999999956 | 0.902 | 0.919 | 0.999 | 0.966 | 0.995 |
| 0.902499999999956 | 0.903 | 0.92 | 0.999 | 0.966 | 0.995 |
| 0.902999999999956 | 0.903 | 0.92 | 0.999 | 0.967 | 0.995 |
| 0.903499999999956 | 0.904 | 0.92 | 0.999 | 0.967 | 0.995 |
| 0.903999999999956 | 0.904 | 0.921 | 0.999 | 0.967 | 0.995 |
| 0.904499999999956 | 0.905 | 0.921 | 0.999 | 0.967 | 0.995 |
| 0.904999999999956 | 0.905 | 0.922 | 0.999 | 0.967 | 0.995 |
| 0.905499999999956 | 0.906 | 0.922 | 1 | 0.967 | 0.995 |
| 0.905999999999956 | 0.906 | 0.922 | 1 | 0.968 | 0.995 |
| 0.906499999999956 | 0.907 | 0.923 | 1 | 0.968 | 0.995 |
| 0.906999999999955 | 0.907 | 0.923 | 1 | 0.968 | 0.995 |
| 0.907499999999955 | 0.908 | 0.924 | 1 | 0.968 | 0.995 |
| 0.907999999999955 | 0.908 | 0.924 | 1 | 0.968 | 0.995 |
| 0.908499999999955 | 0.909 | 0.925 | 1 | 0.969 | 0.995 |
| 0.908999999999955 | 0.909 | 0.925 | 1 | 0.969 | 0.995 |
| 0.909499999999955 | 0.91 | 0.925 | 1 | 0.969 | 0.995 |
| 0.909999999999955 | 0.91 | 0.926 | 1 | 0.969 | 0.995 |
| 0.910499999999955 | 0.911 | 0.926 | 1 | 0.969 | 0.995 |
| 0.910999999999955 | 0.911 | 0.927 | 1 | 0.969 | 0.995 |
| 0.911499999999955 | 0.912 | 0.927 | 1 | 0.97 | 0.995 |
| 0.911999999999955 | 0.912 | 0.927 | 1 | 0.97 | 0.995 |
| 0.912499999999955 | 0.913 | 0.928 | 1 | 0.97 | 0.995 |
| 0.912999999999955 | 0.913 | 0.928 | 1 | 0.97 | 0.995 |
| 0.913499999999955 | 0.914 | 0.929 | 1 | 0.97 | 0.995 |
| 0.913999999999955 | 0.914 | 0.929 | 1 | 0.97 | 0.995 |
| 0.914499999999955 | 0.915 | 0.929 | 1 | 0.971 | 0.995 |
| 0.914999999999955 | 0.915 | 0.93 | 1 | 0.971 | 0.995 |
| 0.915499999999955 | 0.916 | 0.93 | 1 | 0.971 | 0.995 |
| 0.915999999999954 | 0.916 | 0.931 | 1 | 0.971 | 0.995 |
| 0.916499999999954 | 0.917 | 0.931 | 1 | 0.971 | 0.995 |
| 0.916999999999954 | 0.917 | 0.932 | 1 | 0.972 | 0.995 |
| 0.917499999999954 | 0.918 | 0.932 | 1 | 0.972 | 0.995 |
| 0.917999999999954 | 0.918 | 0.932 | 1 | 0.972 | 0.996 |
| 0.918499999999954 | 0.919 | 0.933 | 1 | 0.972 | 0.996 |
| 0.918999999999954 | 0.919 | 0.933 | 1 | 0.972 | 0.996 |
| 0.919499999999954 | 0.92 | 0.934 | 1 | 0.972 | 0.996 |
| 0.919999999999954 | 0.92 | 0.934 | 1 | 0.973 | 0.996 |
| 0.920499999999954 | 0.921 | 0.934 | 1 | 0.973 | 0.996 |
| 0.920999999999954 | 0.921 | 0.935 | 1 | 0.973 | 0.996 |
| 0.921499999999954 | 0.922 | 0.935 | 1 | 0.973 | 0.996 |
| 0.921999999999954 | 0.922 | 0.936 | 1 | 0.973 | 0.996 |
| 0.922499999999954 | 0.923 | 0.936 | 1 | 0.973 | 0.996 |
| 0.922999999999954 | 0.923 | 0.937 | 1 | 0.974 | 0.996 |
| 0.923499999999954 | 0.924 | 0.937 | 1 | 0.974 | 0.996 |
| 0.923999999999954 | 0.924 | 0.937 | 1 | 0.974 | 0.996 |
| 0.924499999999954 | 0.925 | 0.938 | 1 | 0.974 | 0.996 |
| 0.924999999999953 | 0.925 | 0.938 | 1 | 0.974 | 0.996 |
| 0.925499999999953 | 0.926 | 0.939 | 1 | 0.975 | 0.996 |
| 0.925999999999953 | 0.926 | 0.939 | 1 | 0.975 | 0.996 |
| 0.926499999999953 | 0.927 | 0.939 | 1 | 0.975 | 0.996 |
| 0.926999999999953 | 0.927 | 0.94 | 1 | 0.975 | 0.996 |
| 0.927499999999953 | 0.928 | 0.94 | 1 | 0.975 | 0.996 |
| 0.927999999999953 | 0.928 | 0.941 | 1 | 0.975 | 0.996 |
| 0.928499999999953 | 0.929 | 0.941 | 1 | 0.976 | 0.996 |
| 0.928999999999953 | 0.929 | 0.942 | 1 | 0.976 | 0.996 |
| 0.929499999999953 | 0.93 | 0.942 | 1 | 0.976 | 0.996 |
| 0.929999999999953 | 0.93 | 0.942 | 1 | 0.976 | 0.996 |
| 0.930499999999953 | 0.931 | 0.943 | 1 | 0.976 | 0.996 |
| 0.930999999999953 | 0.931 | 0.943 | 1 | 0.976 | 0.996 |
| 0.931499999999953 | 0.932 | 0.944 | 1 | 0.977 | 0.996 |
| 0.931999999999953 | 0.932 | 0.944 | 1 | 0.977 | 0.996 |
| 0.932499999999953 | 0.933 | 0.944 | 1 | 0.977 | 0.996 |
| 0.932999999999953 | 0.933 | 0.945 | 1 | 0.977 | 0.996 |
| 0.933499999999953 | 0.934 | 0.945 | 1 | 0.977 | 0.996 |
| 0.933999999999953 | 0.934 | 0.946 | 1 | 0.978 | 0.996 |
| 0.934499999999952 | 0.935 | 0.946 | 1 | 0.978 | 0.996 |
| 0.934999999999952 | 0.935 | 0.947 | 1 | 0.978 | 0.996 |
| 0.935499999999952 | 0.936 | 0.947 | 1 | 0.978 | 0.996 |
| 0.935999999999952 | 0.936 | 0.947 | 1 | 0.978 | 0.997 |
| 0.936499999999952 | 0.937 | 0.948 | 1 | 0.978 | 0.997 |
| 0.936999999999952 | 0.937 | 0.948 | 1 | 0.979 | 0.997 |
| 0.937499999999952 | 0.938 | 0.949 | 1 | 0.979 | 0.997 |
| 0.937999999999952 | 0.938 | 0.949 | 1 | 0.979 | 0.997 |
| 0.938499999999952 | 0.939 | 0.949 | 1 | 0.979 | 0.997 |
| 0.938999999999952 | 0.939 | 0.95 | 1 | 0.979 | 0.997 |
| 0.939499999999952 | 0.94 | 0.95 | 1 | 0.979 | 0.997 |
| 0.939999999999952 | 0.94 | 0.951 | 1 | 0.98 | 0.997 |
| 0.940499999999952 | 0.941 | 0.951 | 1 | 0.98 | 0.997 |
| 0.940999999999952 | 0.941 | 0.951 | 1 | 0.98 | 0.997 |
| 0.941499999999952 | 0.942 | 0.952 | 1 | 0.98 | 0.997 |
| 0.941999999999952 | 0.942 | 0.952 | 1 | 0.98 | 0.997 |
| 0.942499999999952 | 0.943 | 0.953 | 1 | 0.98 | 0.997 |
| 0.942999999999952 | 0.943 | 0.953 | 1 | 0.981 | 0.997 |
| 0.943499999999951 | 0.944 | 0.954 | 1 | 0.981 | 0.997 |
| 0.943999999999951 | 0.944 | 0.954 | 1 | 0.981 | 0.997 |
| 0.944499999999951 | 0.945 | 0.954 | 1 | 0.981 | 0.997 |
| 0.944999999999951 | 0.945 | 0.955 | 1 | 0.981 | 0.997 |
| 0.945499999999951 | 0.946 | 0.955 | 1 | 0.981 | 0.997 |
| 0.945999999999951 | 0.946 | 0.956 | 1 | 0.982 | 0.997 |
| 0.946499999999951 | 0.947 | 0.956 | 1 | 0.982 | 0.997 |
| 0.946999999999951 | 0.947 | 0.956 | 1 | 0.982 | 0.997 |
| 0.947499999999951 | 0.948 | 0.957 | 1 | 0.982 | 0.997 |
| 0.947999999999951 | 0.948 | 0.957 | 1 | 0.982 | 0.997 |
| 0.948499999999951 | 0.949 | 0.958 | 1 | 0.983 | 0.997 |
| 0.948999999999951 | 0.949 | 0.958 | 1 | 0.983 | 0.997 |
| 0.949499999999951 | 0.95 | 0.958 | 1 | 0.983 | 0.997 |
| 0.949999999999951 | 0.95 | 0.959 | 1 | 0.983 | 0.997 |
| 0.950499999999951 | 0.951 | 0.959 | 1 | 0.983 | 0.997 |
| 0.950999999999951 | 0.951 | 0.96 | 1 | 0.983 | 0.997 |
| 0.951499999999951 | 0.952 | 0.96 | 1 | 0.984 | 0.997 |
| 0.951999999999951 | 0.952 | 0.961 | 1 | 0.984 | 0.997 |
| 0.95249999999995 | 0.953 | 0.961 | 1 | 0.984 | 0.997 |
| 0.95299999999995 | 0.953 | 0.961 | 1 | 0.984 | 0.997 |
| 0.95349999999995 | 0.954 | 0.962 | 1 | 0.984 | 0.997 |
| 0.95399999999995 | 0.954 | 0.962 | 1 | 0.984 | 0.998 |
| 0.95449999999995 | 0.955 | 0.963 | 1 | 0.985 | 0.998 |
| 0.95499999999995 | 0.955 | 0.963 | 1 | 0.985 | 0.998 |
| 0.95549999999995 | 0.956 | 0.963 | 1 | 0.985 | 0.998 |
| 0.95599999999995 | 0.956 | 0.964 | 1 | 0.985 | 0.998 |
| 0.95649999999995 | 0.957 | 0.964 | 1 | 0.985 | 0.998 |
| 0.95699999999995 | 0.957 | 0.965 | 1 | 0.985 | 0.998 |
| 0.95749999999995 | 0.958 | 0.965 | 1 | 0.986 | 0.998 |
| 0.95799999999995 | 0.958 | 0.966 | 1 | 0.986 | 0.998 |
| 0.95849999999995 | 0.959 | 0.966 | 1 | 0.986 | 0.998 |
| 0.95899999999995 | 0.959 | 0.966 | 1 | 0.986 | 0.998 |
| 0.95949999999995 | 0.96 | 0.967 | 1 | 0.986 | 0.998 |
| 0.95999999999995 | 0.96 | 0.967 | 1 | 0.986 | 0.998 |
| 0.96049999999995 | 0.961 | 0.968 | 1 | 0.987 | 0.998 |
| 0.96099999999995 | 0.961 | 0.968 | 1 | 0.987 | 0.998 |
| 0.961499999999949 | 0.962 | 0.968 | 1 | 0.987 | 0.998 |
| 0.961999999999949 | 0.962 | 0.969 | 1 | 0.987 | 0.998 |
| 0.962499999999949 | 0.963 | 0.969 | 1 | 0.987 | 0.998 |
| 0.962999999999949 | 0.963 | 0.97 | 1 | 0.988 | 0.998 |
| 0.963499999999949 | 0.964 | 0.97 | 1 | 0.988 | 0.998 |
| 0.963999999999949 | 0.964 | 0.97 | 1 | 0.988 | 0.998 |
| 0.964499999999949 | 0.965 | 0.971 | 1 | 0.988 | 0.998 |
| 0.964999999999949 | 0.965 | 0.971 | 1 | 0.988 | 0.998 |
| 0.965499999999949 | 0.966 | 0.972 | 1 | 0.988 | 0.998 |
| 0.965999999999949 | 0.966 | 0.972 | 1 | 0.989 | 0.998 |
| 0.966499999999949 | 0.967 | 0.973 | 1 | 0.989 | 0.998 |
| 0.966999999999949 | 0.967 | 0.973 | 1 | 0.989 | 0.998 |
| 0.967499999999949 | 0.968 | 0.973 | 1 | 0.989 | 0.998 |
| 0.967999999999949 | 0.968 | 0.974 | 1 | 0.989 | 0.998 |
| 0.968499999999949 | 0.969 | 0.974 | 1 | 0.989 | 0.998 |
| 0.968999999999949 | 0.969 | 0.975 | 1 | 0.99 | 0.998 |
| 0.969499999999949 | 0.97 | 0.975 | 1 | 0.99 | 0.998 |
| 0.969999999999949 | 0.97 | 0.975 | 1 | 0.99 | 0.998 |
| 0.970499999999948 | 0.971 | 0.976 | 1 | 0.99 | 0.998 |
| 0.970999999999948 | 0.971 | 0.976 | 1 | 0.99 | 0.998 |
| 0.971499999999948 | 0.972 | 0.977 | 1 | 0.99 | 0.998 |
| 0.971999999999948 | 0.972 | 0.977 | 1 | 0.991 | 0.999 |
| 0.972499999999948 | 0.973 | 0.977 | 1 | 0.991 | 0.999 |
| 0.972999999999948 | 0.973 | 0.978 | 1 | 0.991 | 0.999 |
| 0.973499999999948 | 0.974 | 0.978 | 1 | 0.991 | 0.999 |
| 0.973999999999948 | 0.974 | 0.979 | 1 | 0.991 | 0.999 |
| 0.974499999999948 | 0.975 | 0.979 | 1 | 0.991 | 0.999 |
| 0.974999999999948 | 0.975 | 0.979 | 1 | 0.992 | 0.999 |
| 0.975499999999948 | 0.976 | 0.98 | 1 | 0.992 | 0.999 |
| 0.975999999999948 | 0.976 | 0.98 | 1 | 0.992 | 0.999 |
| 0.976499999999948 | 0.977 | 0.981 | 1 | 0.992 | 0.999 |
| 0.976999999999948 | 0.977 | 0.981 | 1 | 0.992 | 0.999 |
| 0.977499999999948 | 0.978 | 0.982 | 1 | 0.992 | 0.999 |
| 0.977999999999948 | 0.978 | 0.982 | 1 | 0.993 | 0.999 |
| 0.978499999999948 | 0.979 | 0.982 | 1 | 0.993 | 0.999 |
| 0.978999999999948 | 0.979 | 0.983 | 1 | 0.993 | 0.999 |
| 0.979499999999947 | 0.98 | 0.983 | 1 | 0.993 | 0.999 |
| 0.979999999999947 | 0.98 | 0.984 | 1 | 0.993 | 0.999 |
| 0.980499999999947 | 0.981 | 0.984 | 1 | 0.993 | 0.999 |
| 0.980999999999947 | 0.981 | 0.984 | 1 | 0.994 | 0.999 |
| 0.981499999999947 | 0.982 | 0.985 | 1 | 0.994 | 0.999 |
| 0.981999999999947 | 0.982 | 0.985 | 1 | 0.994 | 0.999 |
| 0.982499999999947 | 0.983 | 0.986 | 1 | 0.994 | 0.999 |
| 0.982999999999947 | 0.983 | 0.986 | 1 | 0.994 | 0.999 |
| 0.983499999999947 | 0.984 | 0.986 | 1 | 0.994 | 0.999 |
| 0.983999999999947 | 0.984 | 0.987 | 1 | 0.995 | 0.999 |
| 0.984499999999947 | 0.985 | 0.987 | 1 | 0.995 | 0.999 |
| 0.984999999999947 | 0.985 | 0.988 | 1 | 0.995 | 0.999 |
| 0.985499999999947 | 0.986 | 0.988 | 1 | 0.995 | 0.999 |
| 0.985999999999947 | 0.986 | 0.989 | 1 | 0.995 | 0.999 |
| 0.986499999999947 | 0.987 | 0.989 | 1 | 0.995 | 0.999 |
| 0.986999999999947 | 0.987 | 0.989 | 1 | 0.996 | 0.999 |
| 0.987499999999947 | 0.988 | 0.99 | 1 | 0.996 | 0.999 |
| 0.987999999999947 | 0.988 | 0.99 | 1 | 0.996 | 0.999 |
| 0.988499999999946 | 0.989 | 0.991 | 1 | 0.996 | 0.999 |
| 0.988999999999946 | 0.989 | 0.991 | 1 | 0.996 | 0.999 |
| 0.989499999999946 | 0.99 | 0.991 | 1 | 0.996 | 0.999 |
| 0.989999999999946 | 0.99 | 0.992 | 1 | 0.997 | 0.999 |
| 0.990499999999946 | 0.991 | 0.992 | 1 | 0.997 | 0.999 |
| 0.990999999999946 | 0.991 | 0.993 | 1 | 0.997 | 1 |
| 0.991499999999946 | 0.992 | 0.993 | 1 | 0.997 | 1 |
| 0.991999999999946 | 0.992 | 0.993 | 1 | 0.997 | 1 |
| 0.992499999999946 | 0.993 | 0.994 | 1 | 0.997 | 1 |
| 0.992999999999946 | 0.993 | 0.994 | 1 | 0.998 | 1 |
| 0.993499999999946 | 0.994 | 0.995 | 1 | 0.998 | 1 |
| 0.993999999999946 | 0.994 | 0.995 | 1 | 0.998 | 1 |
| 0.994499999999946 | 0.995 | 0.995 | 1 | 0.998 | 1 |
| 0.994999999999946 | 0.995 | 0.996 | 1 | 0.998 | 1 |
| 0.995499999999946 | 0.996 | 0.996 | 1 | 0.998 | 1 |
| 0.995999999999946 | 0.996 | 0.997 | 1 | 0.999 | 1 |
| 0.996499999999946 | 0.997 | 0.997 | 1 | 0.999 | 1 |
| 0.996999999999946 | 0.997 | 0.998 | 1 | 0.999 | 1 |
| 0.997499999999945 | 0.998 | 0.998 | 1 | 0.999 | 1 |
| 0.997999999999945 | 0.998 | 0.998 | 1 | 0.999 | 1 |
| 0.998499999999945 | 0.999 | 0.999 | 1 | 0.999 | 1 |
| 0.998999999999945 | 0.999 | 0.999 | 1 | 1 | 1 |
| 0.999499999999945 | 1 | 1 | 1 | 1 | 1 |
| 0.999999999999945 | 1 | 1 | 1 | 1 | 1 |